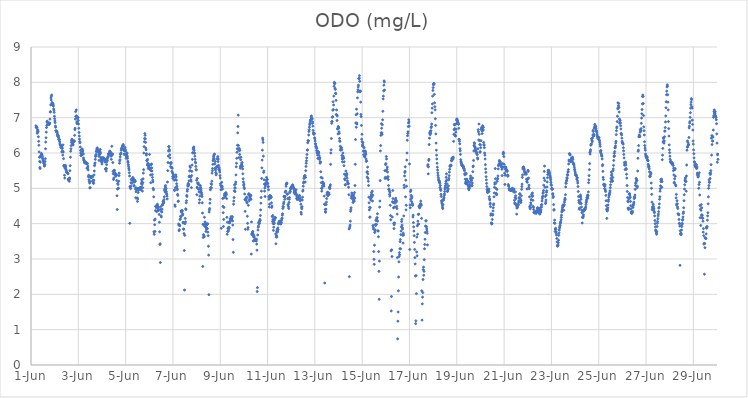
| Category | ODO (mg/L) |
|---|---|
| 44348.208333333336 | 6.77 |
| 44348.21875 | 6.73 |
| 44348.229166666664 | 6.72 |
| 44348.239583333336 | 6.73 |
| 44348.25 | 6.72 |
| 44348.260416666664 | 6.56 |
| 44348.270833333336 | 6.61 |
| 44348.28125 | 6.66 |
| 44348.291666666664 | 6.63 |
| 44348.302083333336 | 6.6 |
| 44348.3125 | 6.46 |
| 44348.322916666664 | 6.33 |
| 44348.333333333336 | 6.22 |
| 44348.34375 | 6.03 |
| 44348.354166666664 | 5.88 |
| 44348.364583333336 | 5.76 |
| 44348.375 | 5.59 |
| 44348.385416666664 | 5.56 |
| 44348.395833333336 | 5.74 |
| 44348.40625 | 5.89 |
| 44348.416666666664 | 5.92 |
| 44348.427083333336 | 5.94 |
| 44348.4375 | 5.99 |
| 44348.447916666664 | 5.97 |
| 44348.458333333336 | 5.95 |
| 44348.46875 | 5.93 |
| 44348.479166666664 | 5.9 |
| 44348.489583333336 | 5.85 |
| 44348.5 | 5.83 |
| 44348.510416666664 | 5.8 |
| 44348.520833333336 | 5.77 |
| 44348.53125 | 5.75 |
| 44348.541666666664 | 5.71 |
| 44348.552083333336 | 5.7 |
| 44348.5625 | 5.63 |
| 44348.572916666664 | 5.64 |
| 44348.583333333336 | 5.67 |
| 44348.59375 | 5.76 |
| 44348.604166666664 | 5.84 |
| 44348.614583333336 | 6.12 |
| 44348.625 | 6.31 |
| 44348.635416666664 | 6.43 |
| 44348.645833333336 | 6.59 |
| 44348.65625 | 6.72 |
| 44348.666666666664 | 6.78 |
| 44348.677083333336 | 6.88 |
| 44348.6875 | 6.9 |
| 44348.697916666664 | 6.86 |
| 44348.708333333336 | 6.81 |
| 44348.71875 | 6.82 |
| 44348.729166666664 | 6.82 |
| 44348.739583333336 | 6.81 |
| 44348.75 | 6.81 |
| 44348.760416666664 | 6.83 |
| 44348.770833333336 | 6.81 |
| 44348.78125 | 6.84 |
| 44348.791666666664 | 6.85 |
| 44348.802083333336 | 6.96 |
| 44348.8125 | 7.16 |
| 44348.822916666664 | 7.17 |
| 44348.833333333336 | 7.36 |
| 44348.84375 | 7.56 |
| 44348.854166666664 | 7.5 |
| 44348.864583333336 | 7.61 |
| 44348.875 | 7.64 |
| 44348.885416666664 | 7.43 |
| 44348.895833333336 | 7.4 |
| 44348.90625 | 7.36 |
| 44348.916666666664 | 7.38 |
| 44348.927083333336 | 7.4 |
| 44348.9375 | 7.36 |
| 44348.947916666664 | 7.33 |
| 44348.958333333336 | 7.25 |
| 44348.96875 | 7.21 |
| 44348.979166666664 | 7.15 |
| 44348.989583333336 | 7.04 |
| 44349.0 | 6.97 |
| 44349.010416666664 | 6.91 |
| 44349.020833333336 | 6.86 |
| 44349.03125 | 6.76 |
| 44349.041666666664 | 6.73 |
| 44349.052083333336 | 6.63 |
| 44349.0625 | 6.63 |
| 44349.072916666664 | 6.6 |
| 44349.083333333336 | 6.6 |
| 44349.09375 | 6.61 |
| 44349.104166666664 | 6.58 |
| 44349.114583333336 | 6.51 |
| 44349.125 | 6.53 |
| 44349.135416666664 | 6.47 |
| 44349.145833333336 | 6.47 |
| 44349.15625 | 6.49 |
| 44349.166666666664 | 6.43 |
| 44349.177083333336 | 6.38 |
| 44349.1875 | 6.38 |
| 44349.197916666664 | 6.39 |
| 44349.208333333336 | 6.33 |
| 44349.21875 | 6.28 |
| 44349.229166666664 | 6.23 |
| 44349.239583333336 | 6.23 |
| 44349.25 | 6.22 |
| 44349.260416666664 | 6.17 |
| 44349.270833333336 | 6.16 |
| 44349.28125 | 6.2 |
| 44349.291666666664 | 6.14 |
| 44349.302083333336 | 6.03 |
| 44349.3125 | 6.16 |
| 44349.322916666664 | 6.13 |
| 44349.333333333336 | 6.06 |
| 44349.34375 | 5.94 |
| 44349.354166666664 | 6.23 |
| 44349.364583333336 | 6.03 |
| 44349.375 | 5.84 |
| 44349.385416666664 | 5.65 |
| 44349.395833333336 | 5.62 |
| 44349.40625 | 5.64 |
| 44349.416666666664 | 5.37 |
| 44349.427083333336 | 5.29 |
| 44349.4375 | 5.57 |
| 44349.447916666664 | 5.63 |
| 44349.458333333336 | 5.65 |
| 44349.46875 | 5.6 |
| 44349.479166666664 | 5.54 |
| 44349.489583333336 | 5.51 |
| 44349.5 | 5.47 |
| 44349.510416666664 | 5.46 |
| 44349.520833333336 | 5.45 |
| 44349.53125 | 5.44 |
| 44349.541666666664 | 5.44 |
| 44349.552083333336 | 5.42 |
| 44349.5625 | 5.41 |
| 44349.572916666664 | 5.24 |
| 44349.583333333336 | 5.25 |
| 44349.59375 | 5.26 |
| 44349.604166666664 | 5.28 |
| 44349.614583333336 | 5.2 |
| 44349.625 | 5.25 |
| 44349.635416666664 | 5.29 |
| 44349.645833333336 | 5.5 |
| 44349.65625 | 5.64 |
| 44349.666666666664 | 5.88 |
| 44349.677083333336 | 6.05 |
| 44349.6875 | 6.12 |
| 44349.697916666664 | 6.21 |
| 44349.708333333336 | 6.3 |
| 44349.71875 | 6.36 |
| 44349.729166666664 | 6.39 |
| 44349.739583333336 | 6.34 |
| 44349.75 | 6.28 |
| 44349.760416666664 | 6.23 |
| 44349.770833333336 | 6.29 |
| 44349.78125 | 6.23 |
| 44349.791666666664 | 6.31 |
| 44349.802083333336 | 6.35 |
| 44349.8125 | 6.34 |
| 44349.822916666664 | 6.34 |
| 44349.833333333336 | 6.33 |
| 44349.84375 | 6.5 |
| 44349.854166666664 | 6.66 |
| 44349.864583333336 | 6.7 |
| 44349.875 | 6.96 |
| 44349.885416666664 | 7.17 |
| 44349.895833333336 | 7.04 |
| 44349.90625 | 7.04 |
| 44349.916666666664 | 7.22 |
| 44349.927083333336 | 7.05 |
| 44349.9375 | 6.88 |
| 44349.947916666664 | 6.83 |
| 44349.958333333336 | 6.86 |
| 44349.96875 | 6.98 |
| 44349.979166666664 | 7 |
| 44349.989583333336 | 7 |
| 44350.0 | 6.92 |
| 44350.010416666664 | 6.82 |
| 44350.020833333336 | 6.7 |
| 44350.03125 | 6.58 |
| 44350.041666666664 | 6.48 |
| 44350.052083333336 | 6.39 |
| 44350.0625 | 6.32 |
| 44350.072916666664 | 6.29 |
| 44350.083333333336 | 6.17 |
| 44350.09375 | 6.07 |
| 44350.104166666664 | 6 |
| 44350.114583333336 | 5.93 |
| 44350.125 | 5.93 |
| 44350.135416666664 | 5.94 |
| 44350.145833333336 | 5.95 |
| 44350.15625 | 6.11 |
| 44350.166666666664 | 6.11 |
| 44350.177083333336 | 6.04 |
| 44350.1875 | 6.06 |
| 44350.197916666664 | 5.98 |
| 44350.208333333336 | 5.97 |
| 44350.21875 | 5.86 |
| 44350.229166666664 | 5.82 |
| 44350.239583333336 | 5.79 |
| 44350.25 | 5.78 |
| 44350.260416666664 | 5.73 |
| 44350.270833333336 | 5.72 |
| 44350.28125 | 5.74 |
| 44350.291666666664 | 5.74 |
| 44350.302083333336 | 5.72 |
| 44350.3125 | 5.74 |
| 44350.322916666664 | 5.73 |
| 44350.333333333336 | 5.71 |
| 44350.34375 | 5.71 |
| 44350.354166666664 | 5.7 |
| 44350.364583333336 | 5.57 |
| 44350.375 | 5.71 |
| 44350.385416666664 | 5.7 |
| 44350.395833333336 | 5.58 |
| 44350.40625 | 5.63 |
| 44350.416666666664 | 5.52 |
| 44350.427083333336 | 5.33 |
| 44350.4375 | 5.37 |
| 44350.447916666664 | 5.24 |
| 44350.458333333336 | 5.33 |
| 44350.46875 | 5.19 |
| 44350.479166666664 | 5.15 |
| 44350.489583333336 | 5.01 |
| 44350.5 | 5.02 |
| 44350.510416666664 | 5.19 |
| 44350.520833333336 | 5.3 |
| 44350.53125 | 5.33 |
| 44350.541666666664 | 5.34 |
| 44350.552083333336 | 5.31 |
| 44350.5625 | 5.31 |
| 44350.572916666664 | 5.33 |
| 44350.583333333336 | 5.33 |
| 44350.59375 | 5.32 |
| 44350.604166666664 | 5.34 |
| 44350.614583333336 | 5.22 |
| 44350.625 | 5.19 |
| 44350.635416666664 | 5.15 |
| 44350.645833333336 | 5.14 |
| 44350.65625 | 5.23 |
| 44350.666666666664 | 5.38 |
| 44350.677083333336 | 5.49 |
| 44350.6875 | 5.64 |
| 44350.697916666664 | 5.69 |
| 44350.708333333336 | 5.72 |
| 44350.71875 | 5.82 |
| 44350.729166666664 | 5.9 |
| 44350.739583333336 | 5.93 |
| 44350.75 | 5.96 |
| 44350.760416666664 | 6.04 |
| 44350.770833333336 | 6.06 |
| 44350.78125 | 6.11 |
| 44350.791666666664 | 6.14 |
| 44350.802083333336 | 6.14 |
| 44350.8125 | 6.1 |
| 44350.822916666664 | 6.06 |
| 44350.833333333336 | 6.08 |
| 44350.84375 | 6.05 |
| 44350.854166666664 | 6.01 |
| 44350.864583333336 | 5.91 |
| 44350.875 | 5.79 |
| 44350.885416666664 | 5.96 |
| 44350.895833333336 | 6.05 |
| 44350.90625 | 5.96 |
| 44350.916666666664 | 6.05 |
| 44350.927083333336 | 6.1 |
| 44350.9375 | 6 |
| 44350.947916666664 | 5.88 |
| 44350.958333333336 | 5.84 |
| 44350.96875 | 5.77 |
| 44350.979166666664 | 5.79 |
| 44350.989583333336 | 5.74 |
| 44351.0 | 5.69 |
| 44351.010416666664 | 5.79 |
| 44351.020833333336 | 5.77 |
| 44351.03125 | 5.84 |
| 44351.041666666664 | 5.87 |
| 44351.052083333336 | 5.86 |
| 44351.0625 | 5.85 |
| 44351.072916666664 | 5.84 |
| 44351.083333333336 | 5.84 |
| 44351.09375 | 5.85 |
| 44351.104166666664 | 5.82 |
| 44351.114583333336 | 5.83 |
| 44351.125 | 5.79 |
| 44351.135416666664 | 5.74 |
| 44351.145833333336 | 5.55 |
| 44351.15625 | 5.56 |
| 44351.166666666664 | 5.54 |
| 44351.177083333336 | 5.49 |
| 44351.1875 | 5.56 |
| 44351.197916666664 | 5.67 |
| 44351.208333333336 | 5.75 |
| 44351.21875 | 5.83 |
| 44351.229166666664 | 5.79 |
| 44351.239583333336 | 5.87 |
| 44351.25 | 5.88 |
| 44351.260416666664 | 5.91 |
| 44351.270833333336 | 5.97 |
| 44351.28125 | 5.98 |
| 44351.291666666664 | 5.98 |
| 44351.302083333336 | 5.96 |
| 44351.3125 | 6 |
| 44351.322916666664 | 6.05 |
| 44351.333333333336 | 5.98 |
| 44351.34375 | 6.05 |
| 44351.354166666664 | 6.03 |
| 44351.364583333336 | 6 |
| 44351.375 | 5.92 |
| 44351.385416666664 | 5.91 |
| 44351.395833333336 | 5.82 |
| 44351.40625 | 5.97 |
| 44351.416666666664 | 6.19 |
| 44351.427083333336 | 5.94 |
| 44351.4375 | 5.97 |
| 44351.447916666664 | 5.97 |
| 44351.458333333336 | 5.73 |
| 44351.46875 | 5.48 |
| 44351.479166666664 | 5.41 |
| 44351.489583333336 | 5.25 |
| 44351.5 | 5.29 |
| 44351.510416666664 | 5.51 |
| 44351.520833333336 | 5.45 |
| 44351.53125 | 5.51 |
| 44351.541666666664 | 5.43 |
| 44351.552083333336 | 5.44 |
| 44351.5625 | 5.38 |
| 44351.572916666664 | 5.37 |
| 44351.583333333336 | 5.34 |
| 44351.59375 | 5.37 |
| 44351.604166666664 | 5.37 |
| 44351.614583333336 | 5.39 |
| 44351.625 | 5.22 |
| 44351.635416666664 | 4.79 |
| 44351.645833333336 | 4.4 |
| 44351.65625 | 4.98 |
| 44351.666666666664 | 5.14 |
| 44351.677083333336 | 5.11 |
| 44351.6875 | 5 |
| 44351.697916666664 | 5 |
| 44351.708333333336 | 5.2 |
| 44351.71875 | 5.36 |
| 44351.729166666664 | 5.43 |
| 44351.739583333336 | 5.71 |
| 44351.75 | 5.78 |
| 44351.760416666664 | 5.81 |
| 44351.770833333336 | 5.89 |
| 44351.78125 | 5.96 |
| 44351.791666666664 | 5.98 |
| 44351.802083333336 | 6 |
| 44351.8125 | 6.08 |
| 44351.822916666664 | 6.12 |
| 44351.833333333336 | 6.14 |
| 44351.84375 | 6.12 |
| 44351.854166666664 | 6.13 |
| 44351.864583333336 | 6.2 |
| 44351.875 | 6.18 |
| 44351.885416666664 | 6.2 |
| 44351.895833333336 | 6.24 |
| 44351.90625 | 6.21 |
| 44351.916666666664 | 6.1 |
| 44351.927083333336 | 6.07 |
| 44351.9375 | 5.96 |
| 44351.947916666664 | 5.97 |
| 44351.958333333336 | 6.09 |
| 44351.96875 | 6.07 |
| 44351.979166666664 | 6.16 |
| 44351.989583333336 | 6.1 |
| 44352.0 | 6.05 |
| 44352.010416666664 | 5.96 |
| 44352.020833333336 | 5.85 |
| 44352.03125 | 5.92 |
| 44352.041666666664 | 5.9 |
| 44352.052083333336 | 5.98 |
| 44352.0625 | 6 |
| 44352.072916666664 | 5.91 |
| 44352.083333333336 | 5.85 |
| 44352.09375 | 5.77 |
| 44352.104166666664 | 5.73 |
| 44352.114583333336 | 5.67 |
| 44352.125 | 5.62 |
| 44352.135416666664 | 5.57 |
| 44352.145833333336 | 5.52 |
| 44352.15625 | 5.44 |
| 44352.166666666664 | 5.35 |
| 44352.177083333336 | 4.01 |
| 44352.1875 | 5.05 |
| 44352.197916666664 | 5.03 |
| 44352.208333333336 | 4.99 |
| 44352.21875 | 5.06 |
| 44352.229166666664 | 5.16 |
| 44352.239583333336 | 5.25 |
| 44352.25 | 5.25 |
| 44352.260416666664 | 5.14 |
| 44352.270833333336 | 5.24 |
| 44352.28125 | 5.24 |
| 44352.291666666664 | 5.25 |
| 44352.302083333336 | 5.31 |
| 44352.3125 | 5.26 |
| 44352.322916666664 | 5.2 |
| 44352.333333333336 | 5.28 |
| 44352.34375 | 5.18 |
| 44352.354166666664 | 5.08 |
| 44352.364583333336 | 5.06 |
| 44352.375 | 5.18 |
| 44352.385416666664 | 5.2 |
| 44352.395833333336 | 5.23 |
| 44352.40625 | 5.2 |
| 44352.416666666664 | 4.98 |
| 44352.427083333336 | 4.73 |
| 44352.4375 | 4.9 |
| 44352.447916666664 | 5.01 |
| 44352.458333333336 | 4.96 |
| 44352.46875 | 4.98 |
| 44352.479166666664 | 5 |
| 44352.489583333336 | 4.73 |
| 44352.5 | 4.63 |
| 44352.510416666664 | 4.7 |
| 44352.520833333336 | 4.99 |
| 44352.53125 | 4.88 |
| 44352.541666666664 | 4.94 |
| 44352.552083333336 | 4.98 |
| 44352.5625 | 4.99 |
| 44352.572916666664 | 5 |
| 44352.583333333336 | 5.01 |
| 44352.59375 | 5 |
| 44352.604166666664 | 4.99 |
| 44352.614583333336 | 4.99 |
| 44352.625 | 5.02 |
| 44352.635416666664 | 5 |
| 44352.645833333336 | 4.96 |
| 44352.65625 | 5.04 |
| 44352.666666666664 | 5.14 |
| 44352.677083333336 | 5.24 |
| 44352.6875 | 5.18 |
| 44352.697916666664 | 5.11 |
| 44352.708333333336 | 4.92 |
| 44352.71875 | 5.02 |
| 44352.729166666664 | 5.16 |
| 44352.739583333336 | 5.27 |
| 44352.75 | 5.43 |
| 44352.760416666664 | 5.53 |
| 44352.770833333336 | 6 |
| 44352.78125 | 6.18 |
| 44352.791666666664 | 6.32 |
| 44352.802083333336 | 6.41 |
| 44352.8125 | 6.55 |
| 44352.822916666664 | 6.5 |
| 44352.833333333336 | 6.4 |
| 44352.84375 | 6.3 |
| 44352.854166666664 | 6.14 |
| 44352.864583333336 | 6.09 |
| 44352.875 | 5.94 |
| 44352.885416666664 | 5.98 |
| 44352.895833333336 | 5.79 |
| 44352.90625 | 5.78 |
| 44352.916666666664 | 5.66 |
| 44352.927083333336 | 5.82 |
| 44352.9375 | 5.71 |
| 44352.947916666664 | 5.65 |
| 44352.958333333336 | 5.56 |
| 44352.96875 | 5.6 |
| 44352.979166666664 | 5.65 |
| 44352.989583333336 | 5.65 |
| 44353.0 | 5.67 |
| 44353.010416666664 | 5.96 |
| 44353.020833333336 | 5.59 |
| 44353.03125 | 5.53 |
| 44353.041666666664 | 5.55 |
| 44353.052083333336 | 5.38 |
| 44353.0625 | 5.16 |
| 44353.072916666664 | 5.5 |
| 44353.083333333336 | 5.67 |
| 44353.09375 | 5.69 |
| 44353.104166666664 | 5.58 |
| 44353.114583333336 | 5.49 |
| 44353.125 | 5.39 |
| 44353.135416666664 | 5.31 |
| 44353.145833333336 | 5.23 |
| 44353.15625 | 5.18 |
| 44353.166666666664 | 5 |
| 44353.177083333336 | 4.96 |
| 44353.1875 | 4.76 |
| 44353.197916666664 | 3.77 |
| 44353.208333333336 | 3.7 |
| 44353.21875 | 4.1 |
| 44353.229166666664 | 3.97 |
| 44353.239583333336 | 3.78 |
| 44353.25 | 4.13 |
| 44353.260416666664 | 4.37 |
| 44353.270833333336 | 4.49 |
| 44353.28125 | 4.49 |
| 44353.291666666664 | 4.48 |
| 44353.302083333336 | 4.45 |
| 44353.3125 | 4.34 |
| 44353.322916666664 | 4.48 |
| 44353.333333333336 | 4.53 |
| 44353.34375 | 4.55 |
| 44353.354166666664 | 4.37 |
| 44353.364583333336 | 4.49 |
| 44353.375 | 4.43 |
| 44353.385416666664 | 4.46 |
| 44353.395833333336 | 4.39 |
| 44353.40625 | 4.38 |
| 44353.416666666664 | 4.26 |
| 44353.427083333336 | 4.04 |
| 44353.4375 | 3.77 |
| 44353.447916666664 | 3.41 |
| 44353.458333333336 | 3.43 |
| 44353.46875 | 2.9 |
| 44353.479166666664 | 4.48 |
| 44353.489583333336 | 4.4 |
| 44353.5 | 4.22 |
| 44353.510416666664 | 4.19 |
| 44353.520833333336 | 4.34 |
| 44353.53125 | 4.33 |
| 44353.541666666664 | 4.41 |
| 44353.552083333336 | 4.53 |
| 44353.5625 | 4.53 |
| 44353.572916666664 | 4.56 |
| 44353.583333333336 | 4.62 |
| 44353.59375 | 4.64 |
| 44353.604166666664 | 4.58 |
| 44353.614583333336 | 4.61 |
| 44353.625 | 4.68 |
| 44353.635416666664 | 4.76 |
| 44353.645833333336 | 4.95 |
| 44353.65625 | 4.98 |
| 44353.666666666664 | 4.9 |
| 44353.677083333336 | 5.04 |
| 44353.6875 | 5.08 |
| 44353.697916666664 | 4.98 |
| 44353.708333333336 | 5 |
| 44353.71875 | 4.91 |
| 44353.729166666664 | 4.86 |
| 44353.739583333336 | 4.82 |
| 44353.75 | 4.78 |
| 44353.760416666664 | 4.7 |
| 44353.770833333336 | 5.18 |
| 44353.78125 | 5.5 |
| 44353.791666666664 | 5.73 |
| 44353.802083333336 | 5.91 |
| 44353.8125 | 6.06 |
| 44353.822916666664 | 6.18 |
| 44353.833333333336 | 6.18 |
| 44353.84375 | 6.1 |
| 44353.854166666664 | 6.06 |
| 44353.864583333336 | 5.95 |
| 44353.875 | 5.86 |
| 44353.885416666664 | 5.71 |
| 44353.895833333336 | 5.62 |
| 44353.90625 | 5.7 |
| 44353.916666666664 | 5.71 |
| 44353.927083333336 | 5.73 |
| 44353.9375 | 5.58 |
| 44353.947916666664 | 5.59 |
| 44353.958333333336 | 5.48 |
| 44353.96875 | 5.57 |
| 44353.979166666664 | 5.44 |
| 44353.989583333336 | 5.33 |
| 44354.0 | 5.28 |
| 44354.010416666664 | 5.4 |
| 44354.020833333336 | 5.38 |
| 44354.03125 | 5.32 |
| 44354.041666666664 | 5.33 |
| 44354.052083333336 | 5.23 |
| 44354.0625 | 4.95 |
| 44354.072916666664 | 4.94 |
| 44354.083333333336 | 4.53 |
| 44354.09375 | 4.49 |
| 44354.104166666664 | 5.02 |
| 44354.114583333336 | 5.25 |
| 44354.125 | 5.38 |
| 44354.135416666664 | 5.33 |
| 44354.145833333336 | 5.23 |
| 44354.15625 | 5.13 |
| 44354.166666666664 | 5.06 |
| 44354.177083333336 | 5 |
| 44354.1875 | 4.96 |
| 44354.197916666664 | 4.83 |
| 44354.208333333336 | 4.8 |
| 44354.21875 | 4.63 |
| 44354.229166666664 | 4.64 |
| 44354.239583333336 | 3.99 |
| 44354.25 | 3.96 |
| 44354.260416666664 | 3.8 |
| 44354.270833333336 | 3.83 |
| 44354.28125 | 3.96 |
| 44354.291666666664 | 3.94 |
| 44354.302083333336 | 4.12 |
| 44354.3125 | 4.13 |
| 44354.322916666664 | 4.21 |
| 44354.333333333336 | 4.19 |
| 44354.34375 | 4.36 |
| 44354.354166666664 | 4.35 |
| 44354.364583333336 | 4.32 |
| 44354.375 | 4.37 |
| 44354.385416666664 | 4.34 |
| 44354.395833333336 | 4.37 |
| 44354.40625 | 4.24 |
| 44354.416666666664 | 4.27 |
| 44354.427083333336 | 4.04 |
| 44354.4375 | 4.02 |
| 44354.447916666664 | 3.85 |
| 44354.458333333336 | 3.84 |
| 44354.46875 | 3.72 |
| 44354.479166666664 | 3.24 |
| 44354.489583333336 | 2.12 |
| 44354.5 | 3.67 |
| 44354.510416666664 | 4 |
| 44354.520833333336 | 4.15 |
| 44354.53125 | 4.05 |
| 44354.541666666664 | 4.42 |
| 44354.552083333336 | 4.4 |
| 44354.5625 | 4.59 |
| 44354.572916666664 | 4.65 |
| 44354.583333333336 | 4.8 |
| 44354.59375 | 4.77 |
| 44354.604166666664 | 4.92 |
| 44354.614583333336 | 4.97 |
| 44354.625 | 5.09 |
| 44354.635416666664 | 5.06 |
| 44354.645833333336 | 5.14 |
| 44354.65625 | 5.08 |
| 44354.666666666664 | 5.11 |
| 44354.677083333336 | 5.21 |
| 44354.6875 | 5.33 |
| 44354.697916666664 | 5.35 |
| 44354.708333333336 | 5.49 |
| 44354.71875 | 5.63 |
| 44354.729166666664 | 5.5 |
| 44354.739583333336 | 5.59 |
| 44354.75 | 5.32 |
| 44354.760416666664 | 5.24 |
| 44354.770833333336 | 5.2 |
| 44354.78125 | 5.02 |
| 44354.791666666664 | 5.36 |
| 44354.802083333336 | 5.48 |
| 44354.8125 | 5.66 |
| 44354.822916666664 | 5.82 |
| 44354.833333333336 | 6.01 |
| 44354.84375 | 6 |
| 44354.854166666664 | 6.11 |
| 44354.864583333336 | 6.15 |
| 44354.875 | 6.14 |
| 44354.885416666664 | 6.17 |
| 44354.895833333336 | 6.08 |
| 44354.90625 | 6.01 |
| 44354.916666666664 | 5.99 |
| 44354.927083333336 | 5.91 |
| 44354.9375 | 5.82 |
| 44354.947916666664 | 5.74 |
| 44354.958333333336 | 5.72 |
| 44354.96875 | 5.62 |
| 44354.979166666664 | 5.53 |
| 44354.989583333336 | 5.52 |
| 44355.0 | 5.23 |
| 44355.010416666664 | 4.82 |
| 44355.020833333336 | 5.03 |
| 44355.03125 | 5.28 |
| 44355.041666666664 | 5.15 |
| 44355.052083333336 | 5 |
| 44355.0625 | 5.12 |
| 44355.072916666664 | 5.15 |
| 44355.083333333336 | 5.11 |
| 44355.09375 | 4.97 |
| 44355.104166666664 | 4.9 |
| 44355.114583333336 | 4.59 |
| 44355.125 | 4.68 |
| 44355.135416666664 | 4.78 |
| 44355.145833333336 | 4.89 |
| 44355.15625 | 5.08 |
| 44355.166666666664 | 5.03 |
| 44355.177083333336 | 4.99 |
| 44355.1875 | 4.95 |
| 44355.197916666664 | 4.89 |
| 44355.208333333336 | 4.87 |
| 44355.21875 | 4.82 |
| 44355.229166666664 | 4.77 |
| 44355.239583333336 | 4.59 |
| 44355.25 | 4.3 |
| 44355.260416666664 | 2.79 |
| 44355.270833333336 | 3.98 |
| 44355.28125 | 3.61 |
| 44355.291666666664 | 3.69 |
| 44355.302083333336 | 3.98 |
| 44355.3125 | 3.66 |
| 44355.322916666664 | 3.63 |
| 44355.333333333336 | 4.18 |
| 44355.34375 | 3.93 |
| 44355.354166666664 | 4.05 |
| 44355.364583333336 | 3.92 |
| 44355.375 | 3.97 |
| 44355.385416666664 | 4.01 |
| 44355.395833333336 | 3.78 |
| 44355.40625 | 3.9 |
| 44355.416666666664 | 3.84 |
| 44355.427083333336 | 3.87 |
| 44355.4375 | 3.97 |
| 44355.447916666664 | 3.98 |
| 44355.458333333336 | 3.86 |
| 44355.46875 | 4 |
| 44355.479166666664 | 3.76 |
| 44355.489583333336 | 3.66 |
| 44355.5 | 3.36 |
| 44355.510416666664 | 3.11 |
| 44355.520833333336 | 1.99 |
| 44355.53125 | 4.33 |
| 44355.541666666664 | 4.39 |
| 44355.552083333336 | 4.43 |
| 44355.5625 | 4.58 |
| 44355.572916666664 | 4.69 |
| 44355.583333333336 | 4.96 |
| 44355.59375 | 5.02 |
| 44355.604166666664 | 5.01 |
| 44355.614583333336 | 5.13 |
| 44355.625 | 5.02 |
| 44355.635416666664 | 5.11 |
| 44355.645833333336 | 5.2 |
| 44355.65625 | 5.43 |
| 44355.666666666664 | 5.5 |
| 44355.677083333336 | 5.56 |
| 44355.6875 | 5.68 |
| 44355.697916666664 | 5.78 |
| 44355.708333333336 | 5.83 |
| 44355.71875 | 5.89 |
| 44355.729166666664 | 5.92 |
| 44355.739583333336 | 5.95 |
| 44355.75 | 5.83 |
| 44355.760416666664 | 5.97 |
| 44355.770833333336 | 5.69 |
| 44355.78125 | 5.57 |
| 44355.791666666664 | 5.76 |
| 44355.802083333336 | 5.52 |
| 44355.8125 | 5.45 |
| 44355.822916666664 | 5.38 |
| 44355.833333333336 | 5.41 |
| 44355.84375 | 5.59 |
| 44355.854166666664 | 5.61 |
| 44355.864583333336 | 5.63 |
| 44355.875 | 5.83 |
| 44355.885416666664 | 5.85 |
| 44355.895833333336 | 5.9 |
| 44355.90625 | 5.76 |
| 44355.916666666664 | 5.83 |
| 44355.927083333336 | 5.65 |
| 44355.9375 | 5.53 |
| 44355.947916666664 | 5.59 |
| 44355.958333333336 | 5.55 |
| 44355.96875 | 5.51 |
| 44355.979166666664 | 5.46 |
| 44355.989583333336 | 5.36 |
| 44356.0 | 5.29 |
| 44356.010416666664 | 5.13 |
| 44356.020833333336 | 5.08 |
| 44356.03125 | 4.96 |
| 44356.041666666664 | 3.87 |
| 44356.052083333336 | 5.04 |
| 44356.0625 | 5.17 |
| 44356.072916666664 | 5.03 |
| 44356.083333333336 | 5.06 |
| 44356.09375 | 4.98 |
| 44356.104166666664 | 4.71 |
| 44356.114583333336 | 4.49 |
| 44356.125 | 4.31 |
| 44356.135416666664 | 3.92 |
| 44356.145833333336 | 4.12 |
| 44356.15625 | 4.46 |
| 44356.166666666664 | 4.74 |
| 44356.177083333336 | 4.81 |
| 44356.1875 | 4.85 |
| 44356.197916666664 | 4.79 |
| 44356.208333333336 | 4.77 |
| 44356.21875 | 4.81 |
| 44356.229166666664 | 4.84 |
| 44356.239583333336 | 4.88 |
| 44356.25 | 4.85 |
| 44356.260416666664 | 4.82 |
| 44356.270833333336 | 4.71 |
| 44356.28125 | 4.18 |
| 44356.291666666664 | 3.7 |
| 44356.302083333336 | 4.04 |
| 44356.3125 | 3.78 |
| 44356.322916666664 | 3.87 |
| 44356.333333333336 | 3.78 |
| 44356.34375 | 3.88 |
| 44356.354166666664 | 3.82 |
| 44356.364583333336 | 3.9 |
| 44356.375 | 4.03 |
| 44356.385416666664 | 3.88 |
| 44356.395833333336 | 4.06 |
| 44356.40625 | 4.02 |
| 44356.416666666664 | 4.14 |
| 44356.427083333336 | 4.1 |
| 44356.4375 | 4.11 |
| 44356.447916666664 | 4.13 |
| 44356.458333333336 | 4.2 |
| 44356.46875 | 4.1 |
| 44356.479166666664 | 4.17 |
| 44356.489583333336 | 4.13 |
| 44356.5 | 4.17 |
| 44356.510416666664 | 4.2 |
| 44356.520833333336 | 4.08 |
| 44356.53125 | 3.96 |
| 44356.541666666664 | 3.55 |
| 44356.552083333336 | 3.19 |
| 44356.5625 | 4.55 |
| 44356.572916666664 | 4.64 |
| 44356.583333333336 | 4.74 |
| 44356.59375 | 4.93 |
| 44356.604166666664 | 5.1 |
| 44356.614583333336 | 5.01 |
| 44356.625 | 4.91 |
| 44356.635416666664 | 5.01 |
| 44356.645833333336 | 5.12 |
| 44356.65625 | 5.18 |
| 44356.666666666664 | 5.38 |
| 44356.677083333336 | 5.61 |
| 44356.6875 | 5.71 |
| 44356.697916666664 | 5.85 |
| 44356.708333333336 | 6.02 |
| 44356.71875 | 6.12 |
| 44356.729166666664 | 6.22 |
| 44356.739583333336 | 6.57 |
| 44356.75 | 6.75 |
| 44356.760416666664 | 7.07 |
| 44356.770833333336 | 6.21 |
| 44356.78125 | 6.08 |
| 44356.791666666664 | 5.87 |
| 44356.802083333336 | 6.13 |
| 44356.8125 | 6.07 |
| 44356.822916666664 | 5.96 |
| 44356.833333333336 | 6.08 |
| 44356.84375 | 5.57 |
| 44356.854166666664 | 5.63 |
| 44356.864583333336 | 5.81 |
| 44356.875 | 5.88 |
| 44356.885416666664 | 5.61 |
| 44356.895833333336 | 5.66 |
| 44356.90625 | 5.71 |
| 44356.916666666664 | 5.65 |
| 44356.927083333336 | 5.73 |
| 44356.9375 | 5.62 |
| 44356.947916666664 | 5.55 |
| 44356.958333333336 | 5.41 |
| 44356.96875 | 5.27 |
| 44356.979166666664 | 5.18 |
| 44356.989583333336 | 5.09 |
| 44357.0 | 5.12 |
| 44357.010416666664 | 5.03 |
| 44357.020833333336 | 4.99 |
| 44357.03125 | 4.84 |
| 44357.041666666664 | 4.68 |
| 44357.052083333336 | 4.35 |
| 44357.0625 | 3.84 |
| 44357.072916666664 | 4.68 |
| 44357.083333333336 | 4.66 |
| 44357.09375 | 4.73 |
| 44357.104166666664 | 4.7 |
| 44357.114583333336 | 4.75 |
| 44357.125 | 4.59 |
| 44357.135416666664 | 4.61 |
| 44357.145833333336 | 4.21 |
| 44357.15625 | 4.01 |
| 44357.166666666664 | 3.84 |
| 44357.177083333336 | 3.89 |
| 44357.1875 | 4.52 |
| 44357.197916666664 | 4.82 |
| 44357.208333333336 | 4.85 |
| 44357.21875 | 4.81 |
| 44357.229166666664 | 4.65 |
| 44357.239583333336 | 4.69 |
| 44357.25 | 4.73 |
| 44357.260416666664 | 4.76 |
| 44357.270833333336 | 4.77 |
| 44357.28125 | 4.81 |
| 44357.291666666664 | 4.8 |
| 44357.302083333336 | 4.69 |
| 44357.3125 | 3.14 |
| 44357.322916666664 | 4.05 |
| 44357.333333333336 | 3.69 |
| 44357.34375 | 3.72 |
| 44357.354166666664 | 3.71 |
| 44357.364583333336 | 3.76 |
| 44357.375 | 3.78 |
| 44357.385416666664 | 3.71 |
| 44357.395833333336 | 3.51 |
| 44357.40625 | 3.64 |
| 44357.416666666664 | 3.67 |
| 44357.427083333336 | 3.62 |
| 44357.4375 | 3.62 |
| 44357.447916666664 | 3.55 |
| 44357.458333333336 | 3.52 |
| 44357.46875 | 3.54 |
| 44357.479166666664 | 3.53 |
| 44357.489583333336 | 3.54 |
| 44357.5 | 3.55 |
| 44357.510416666664 | 3.52 |
| 44357.520833333336 | 3.51 |
| 44357.53125 | 3.56 |
| 44357.541666666664 | 3.42 |
| 44357.552083333336 | 3.25 |
| 44357.5625 | 2.08 |
| 44357.572916666664 | 2.19 |
| 44357.583333333336 | 3.68 |
| 44357.59375 | 3.82 |
| 44357.604166666664 | 3.9 |
| 44357.614583333336 | 3.93 |
| 44357.625 | 4.04 |
| 44357.635416666664 | 4 |
| 44357.645833333336 | 4 |
| 44357.65625 | 4.02 |
| 44357.666666666664 | 4.08 |
| 44357.677083333336 | 4.12 |
| 44357.6875 | 4.09 |
| 44357.697916666664 | 4.23 |
| 44357.708333333336 | 4.39 |
| 44357.71875 | 4.58 |
| 44357.729166666664 | 4.74 |
| 44357.739583333336 | 4.92 |
| 44357.75 | 5.28 |
| 44357.760416666664 | 5.58 |
| 44357.770833333336 | 5.8 |
| 44357.78125 | 6.08 |
| 44357.791666666664 | 6.42 |
| 44357.802083333336 | 6.37 |
| 44357.8125 | 6.3 |
| 44357.822916666664 | 5.91 |
| 44357.833333333336 | 5.45 |
| 44357.84375 | 5.49 |
| 44357.854166666664 | 5.24 |
| 44357.864583333336 | 5.12 |
| 44357.875 | 4.92 |
| 44357.885416666664 | 5.01 |
| 44357.895833333336 | 4.77 |
| 44357.90625 | 5.07 |
| 44357.916666666664 | 5.11 |
| 44357.927083333336 | 5.15 |
| 44357.9375 | 5.15 |
| 44357.947916666664 | 5.23 |
| 44357.958333333336 | 5.31 |
| 44357.96875 | 5.21 |
| 44357.979166666664 | 5.26 |
| 44357.989583333336 | 5.25 |
| 44358.0 | 5.13 |
| 44358.010416666664 | 5.14 |
| 44358.020833333336 | 5.04 |
| 44358.03125 | 5.05 |
| 44358.041666666664 | 4.96 |
| 44358.052083333336 | 4.76 |
| 44358.0625 | 4.69 |
| 44358.072916666664 | 4.47 |
| 44358.083333333336 | 4.55 |
| 44358.09375 | 4.8 |
| 44358.104166666664 | 4.78 |
| 44358.114583333336 | 4.73 |
| 44358.125 | 4.75 |
| 44358.135416666664 | 4.78 |
| 44358.145833333336 | 4.77 |
| 44358.15625 | 4.74 |
| 44358.166666666664 | 4.59 |
| 44358.177083333336 | 4.46 |
| 44358.1875 | 4.5 |
| 44358.197916666664 | 4.2 |
| 44358.208333333336 | 4.06 |
| 44358.21875 | 4.23 |
| 44358.229166666664 | 4.12 |
| 44358.239583333336 | 4 |
| 44358.25 | 3.81 |
| 44358.260416666664 | 3.9 |
| 44358.270833333336 | 4.04 |
| 44358.28125 | 4 |
| 44358.291666666664 | 4.1 |
| 44358.302083333336 | 4.17 |
| 44358.3125 | 4.14 |
| 44358.322916666664 | 4.17 |
| 44358.333333333336 | 4.17 |
| 44358.34375 | 3.71 |
| 44358.354166666664 | 3.43 |
| 44358.364583333336 | 3.62 |
| 44358.375 | 3.67 |
| 44358.385416666664 | 3.78 |
| 44358.395833333336 | 3.62 |
| 44358.40625 | 3.84 |
| 44358.416666666664 | 3.76 |
| 44358.427083333336 | 3.79 |
| 44358.4375 | 3.88 |
| 44358.447916666664 | 3.83 |
| 44358.458333333336 | 4.01 |
| 44358.46875 | 3.99 |
| 44358.479166666664 | 4.02 |
| 44358.489583333336 | 4.05 |
| 44358.5 | 4.07 |
| 44358.510416666664 | 4.04 |
| 44358.520833333336 | 4.02 |
| 44358.53125 | 4.07 |
| 44358.541666666664 | 4.06 |
| 44358.552083333336 | 3.99 |
| 44358.5625 | 4.04 |
| 44358.572916666664 | 4 |
| 44358.583333333336 | 4.04 |
| 44358.59375 | 4.1 |
| 44358.604166666664 | 4.14 |
| 44358.614583333336 | 4.16 |
| 44358.625 | 4.24 |
| 44358.635416666664 | 4.28 |
| 44358.645833333336 | 4.43 |
| 44358.65625 | 4.49 |
| 44358.666666666664 | 4.47 |
| 44358.677083333336 | 4.56 |
| 44358.6875 | 4.61 |
| 44358.697916666664 | 4.77 |
| 44358.708333333336 | 4.77 |
| 44358.71875 | 4.76 |
| 44358.729166666664 | 4.69 |
| 44358.739583333336 | 4.77 |
| 44358.75 | 4.89 |
| 44358.760416666664 | 4.91 |
| 44358.770833333336 | 4.92 |
| 44358.78125 | 5.06 |
| 44358.791666666664 | 5.11 |
| 44358.802083333336 | 5.14 |
| 44358.8125 | 5.13 |
| 44358.822916666664 | 5.15 |
| 44358.833333333336 | 4.83 |
| 44358.84375 | 4.84 |
| 44358.854166666664 | 4.71 |
| 44358.864583333336 | 4.53 |
| 44358.875 | 4.54 |
| 44358.885416666664 | 4.48 |
| 44358.895833333336 | 4.43 |
| 44358.90625 | 4.6 |
| 44358.916666666664 | 4.69 |
| 44358.927083333336 | 4.74 |
| 44358.9375 | 4.88 |
| 44358.947916666664 | 4.9 |
| 44358.958333333336 | 4.92 |
| 44358.96875 | 5 |
| 44358.979166666664 | 4.98 |
| 44358.989583333336 | 5.01 |
| 44359.0 | 5.04 |
| 44359.010416666664 | 5.01 |
| 44359.020833333336 | 5.03 |
| 44359.03125 | 5.04 |
| 44359.041666666664 | 5.08 |
| 44359.052083333336 | 5.06 |
| 44359.0625 | 5.1 |
| 44359.072916666664 | 5.07 |
| 44359.083333333336 | 5.04 |
| 44359.09375 | 5.01 |
| 44359.104166666664 | 5.01 |
| 44359.114583333336 | 4.96 |
| 44359.125 | 4.88 |
| 44359.135416666664 | 4.9 |
| 44359.145833333336 | 4.89 |
| 44359.15625 | 4.84 |
| 44359.166666666664 | 4.88 |
| 44359.177083333336 | 4.9 |
| 44359.1875 | 4.96 |
| 44359.197916666664 | 4.96 |
| 44359.208333333336 | 4.85 |
| 44359.21875 | 4.82 |
| 44359.229166666664 | 4.71 |
| 44359.239583333336 | 4.76 |
| 44359.25 | 4.79 |
| 44359.260416666664 | 4.68 |
| 44359.270833333336 | 4.69 |
| 44359.28125 | 4.74 |
| 44359.291666666664 | 4.7 |
| 44359.302083333336 | 4.73 |
| 44359.3125 | 4.75 |
| 44359.322916666664 | 4.75 |
| 44359.333333333336 | 4.76 |
| 44359.34375 | 4.8 |
| 44359.354166666664 | 4.79 |
| 44359.364583333336 | 4.72 |
| 44359.375 | 4.65 |
| 44359.385416666664 | 4.65 |
| 44359.395833333336 | 4.69 |
| 44359.40625 | 4.55 |
| 44359.416666666664 | 4.32 |
| 44359.427083333336 | 4.27 |
| 44359.4375 | 4.46 |
| 44359.447916666664 | 4.42 |
| 44359.458333333336 | 4.48 |
| 44359.46875 | 4.67 |
| 44359.479166666664 | 4.75 |
| 44359.489583333336 | 4.92 |
| 44359.5 | 4.95 |
| 44359.510416666664 | 5.06 |
| 44359.520833333336 | 5.15 |
| 44359.53125 | 5.18 |
| 44359.541666666664 | 5.28 |
| 44359.552083333336 | 5.32 |
| 44359.5625 | 5.35 |
| 44359.572916666664 | 5.35 |
| 44359.583333333336 | 5.36 |
| 44359.59375 | 5.18 |
| 44359.604166666664 | 5.31 |
| 44359.614583333336 | 5.5 |
| 44359.625 | 5.62 |
| 44359.635416666664 | 5.71 |
| 44359.645833333336 | 5.78 |
| 44359.65625 | 5.86 |
| 44359.666666666664 | 5.96 |
| 44359.677083333336 | 6.08 |
| 44359.6875 | 6.09 |
| 44359.697916666664 | 6.29 |
| 44359.708333333336 | 6.35 |
| 44359.71875 | 6.34 |
| 44359.729166666664 | 6.35 |
| 44359.739583333336 | 6.51 |
| 44359.75 | 6.61 |
| 44359.760416666664 | 6.66 |
| 44359.770833333336 | 6.73 |
| 44359.78125 | 6.8 |
| 44359.791666666664 | 6.84 |
| 44359.802083333336 | 6.88 |
| 44359.8125 | 6.92 |
| 44359.822916666664 | 6.94 |
| 44359.833333333336 | 6.95 |
| 44359.84375 | 7.02 |
| 44359.854166666664 | 7.05 |
| 44359.864583333336 | 6.98 |
| 44359.875 | 6.98 |
| 44359.885416666664 | 6.96 |
| 44359.895833333336 | 6.84 |
| 44359.90625 | 6.88 |
| 44359.916666666664 | 6.76 |
| 44359.927083333336 | 6.64 |
| 44359.9375 | 6.57 |
| 44359.947916666664 | 6.54 |
| 44359.958333333336 | 6.53 |
| 44359.96875 | 6.56 |
| 44359.979166666664 | 6.55 |
| 44359.989583333336 | 6.43 |
| 44360.0 | 6.4 |
| 44360.010416666664 | 6.34 |
| 44360.020833333336 | 6.26 |
| 44360.03125 | 6.26 |
| 44360.041666666664 | 6.19 |
| 44360.052083333336 | 6.19 |
| 44360.0625 | 6.15 |
| 44360.072916666664 | 6.07 |
| 44360.083333333336 | 6.13 |
| 44360.09375 | 6 |
| 44360.104166666664 | 6.02 |
| 44360.114583333336 | 5.94 |
| 44360.125 | 5.85 |
| 44360.135416666664 | 6.02 |
| 44360.145833333336 | 6.04 |
| 44360.15625 | 6.02 |
| 44360.166666666664 | 6 |
| 44360.177083333336 | 5.93 |
| 44360.1875 | 5.82 |
| 44360.197916666664 | 5.84 |
| 44360.208333333336 | 5.87 |
| 44360.21875 | 5.71 |
| 44360.229166666664 | 5.75 |
| 44360.239583333336 | 5.74 |
| 44360.25 | 5.47 |
| 44360.260416666664 | 5.31 |
| 44360.270833333336 | 5.16 |
| 44360.28125 | 5 |
| 44360.291666666664 | 4.92 |
| 44360.302083333336 | 5 |
| 44360.3125 | 5.29 |
| 44360.322916666664 | 5.07 |
| 44360.333333333336 | 5.18 |
| 44360.34375 | 5.14 |
| 44360.354166666664 | 5.15 |
| 44360.364583333336 | 5.14 |
| 44360.375 | 5.11 |
| 44360.385416666664 | 5.06 |
| 44360.395833333336 | 4.78 |
| 44360.40625 | 4.55 |
| 44360.416666666664 | 2.32 |
| 44360.427083333336 | 4.54 |
| 44360.4375 | 4.4 |
| 44360.447916666664 | 4.33 |
| 44360.458333333336 | 4.33 |
| 44360.46875 | 4.41 |
| 44360.479166666664 | 4.54 |
| 44360.489583333336 | 4.61 |
| 44360.5 | 4.71 |
| 44360.510416666664 | 4.83 |
| 44360.520833333336 | 4.88 |
| 44360.53125 | 4.86 |
| 44360.541666666664 | 4.89 |
| 44360.552083333336 | 4.79 |
| 44360.5625 | 4.81 |
| 44360.572916666664 | 4.85 |
| 44360.583333333336 | 4.83 |
| 44360.59375 | 4.87 |
| 44360.604166666664 | 4.83 |
| 44360.614583333336 | 5.01 |
| 44360.625 | 5.04 |
| 44360.635416666664 | 4.99 |
| 44360.645833333336 | 5.06 |
| 44360.65625 | 5.1 |
| 44360.666666666664 | 5.68 |
| 44360.677083333336 | 6 |
| 44360.6875 | 6.09 |
| 44360.697916666664 | 6.41 |
| 44360.708333333336 | 6.84 |
| 44360.71875 | 6.89 |
| 44360.729166666664 | 6.89 |
| 44360.739583333336 | 7.01 |
| 44360.75 | 7.03 |
| 44360.760416666664 | 7.21 |
| 44360.770833333336 | 7.45 |
| 44360.78125 | 7.23 |
| 44360.791666666664 | 7.36 |
| 44360.802083333336 | 7.61 |
| 44360.8125 | 7.89 |
| 44360.822916666664 | 8 |
| 44360.833333333336 | 7.96 |
| 44360.84375 | 7.97 |
| 44360.854166666664 | 7.83 |
| 44360.864583333336 | 7.8 |
| 44360.875 | 7.69 |
| 44360.885416666664 | 7.68 |
| 44360.895833333336 | 7.49 |
| 44360.90625 | 7.09 |
| 44360.916666666664 | 7.22 |
| 44360.927083333336 | 7.08 |
| 44360.9375 | 6.92 |
| 44360.947916666664 | 7.05 |
| 44360.958333333336 | 6.68 |
| 44360.96875 | 6.7 |
| 44360.979166666664 | 6.54 |
| 44360.989583333336 | 6.75 |
| 44361.0 | 6.73 |
| 44361.010416666664 | 6.7 |
| 44361.020833333336 | 6.6 |
| 44361.03125 | 6.56 |
| 44361.041666666664 | 6.41 |
| 44361.052083333336 | 6.34 |
| 44361.0625 | 6.33 |
| 44361.072916666664 | 6.19 |
| 44361.083333333336 | 6.08 |
| 44361.09375 | 6.1 |
| 44361.104166666664 | 6.12 |
| 44361.114583333336 | 6.16 |
| 44361.125 | 6.15 |
| 44361.135416666664 | 6.09 |
| 44361.145833333336 | 5.93 |
| 44361.15625 | 5.83 |
| 44361.166666666664 | 5.75 |
| 44361.177083333336 | 5.87 |
| 44361.1875 | 6 |
| 44361.197916666664 | 5.91 |
| 44361.208333333336 | 5.86 |
| 44361.21875 | 5.85 |
| 44361.229166666664 | 5.64 |
| 44361.239583333336 | 5.75 |
| 44361.25 | 5.4 |
| 44361.260416666664 | 5.27 |
| 44361.270833333336 | 5.24 |
| 44361.28125 | 5.1 |
| 44361.291666666664 | 5.1 |
| 44361.302083333336 | 5.38 |
| 44361.3125 | 5.49 |
| 44361.322916666664 | 5.34 |
| 44361.333333333336 | 5.37 |
| 44361.34375 | 5.42 |
| 44361.354166666664 | 5.4 |
| 44361.364583333336 | 5.29 |
| 44361.375 | 5.21 |
| 44361.385416666664 | 5.17 |
| 44361.395833333336 | 5.13 |
| 44361.40625 | 5.13 |
| 44361.416666666664 | 5.13 |
| 44361.427083333336 | 5.03 |
| 44361.4375 | 4.82 |
| 44361.447916666664 | 3.85 |
| 44361.458333333336 | 2.5 |
| 44361.46875 | 3.88 |
| 44361.479166666664 | 3.93 |
| 44361.489583333336 | 3.96 |
| 44361.5 | 4.07 |
| 44361.510416666664 | 4.35 |
| 44361.520833333336 | 4.4 |
| 44361.53125 | 4.45 |
| 44361.541666666664 | 4.72 |
| 44361.552083333336 | 4.77 |
| 44361.5625 | 4.87 |
| 44361.572916666664 | 4.79 |
| 44361.583333333336 | 4.83 |
| 44361.59375 | 4.71 |
| 44361.604166666664 | 4.8 |
| 44361.614583333336 | 4.6 |
| 44361.625 | 4.64 |
| 44361.635416666664 | 4.82 |
| 44361.645833333336 | 4.76 |
| 44361.65625 | 4.7 |
| 44361.666666666664 | 4.64 |
| 44361.677083333336 | 4.88 |
| 44361.6875 | 4.72 |
| 44361.697916666664 | 5.08 |
| 44361.708333333336 | 5.68 |
| 44361.71875 | 6.38 |
| 44361.729166666664 | 6.85 |
| 44361.739583333336 | 7.08 |
| 44361.75 | 6.73 |
| 44361.760416666664 | 7.24 |
| 44361.770833333336 | 6.85 |
| 44361.78125 | 6.82 |
| 44361.791666666664 | 7.11 |
| 44361.802083333336 | 7.56 |
| 44361.8125 | 7.73 |
| 44361.822916666664 | 7.79 |
| 44361.833333333336 | 7.87 |
| 44361.84375 | 7.92 |
| 44361.854166666664 | 8.11 |
| 44361.864583333336 | 8.1 |
| 44361.875 | 8.12 |
| 44361.885416666664 | 8.19 |
| 44361.895833333336 | 8.03 |
| 44361.90625 | 7.73 |
| 44361.916666666664 | 7.75 |
| 44361.927083333336 | 7.75 |
| 44361.9375 | 7.44 |
| 44361.947916666664 | 7.09 |
| 44361.958333333336 | 7.03 |
| 44361.96875 | 6.78 |
| 44361.979166666664 | 6.39 |
| 44361.989583333336 | 6.53 |
| 44362.0 | 6.32 |
| 44362.010416666664 | 6.2 |
| 44362.020833333336 | 6.24 |
| 44362.03125 | 6.29 |
| 44362.041666666664 | 6.19 |
| 44362.052083333336 | 6.05 |
| 44362.0625 | 5.95 |
| 44362.072916666664 | 6.06 |
| 44362.083333333336 | 6.15 |
| 44362.09375 | 5.92 |
| 44362.104166666664 | 5.89 |
| 44362.114583333336 | 5.9 |
| 44362.125 | 6.06 |
| 44362.135416666664 | 5.99 |
| 44362.145833333336 | 6.03 |
| 44362.15625 | 5.96 |
| 44362.166666666664 | 5.83 |
| 44362.177083333336 | 5.76 |
| 44362.1875 | 5.78 |
| 44362.197916666664 | 5.46 |
| 44362.208333333336 | 5.32 |
| 44362.21875 | 5.47 |
| 44362.229166666664 | 5.6 |
| 44362.239583333336 | 5.41 |
| 44362.25 | 5.28 |
| 44362.260416666664 | 5.2 |
| 44362.270833333336 | 5.08 |
| 44362.28125 | 4.75 |
| 44362.291666666664 | 4.59 |
| 44362.302083333336 | 4.39 |
| 44362.3125 | 4.46 |
| 44362.322916666664 | 4.18 |
| 44362.333333333336 | 4.19 |
| 44362.34375 | 4.45 |
| 44362.354166666664 | 4.71 |
| 44362.364583333336 | 4.67 |
| 44362.375 | 4.78 |
| 44362.385416666664 | 4.82 |
| 44362.395833333336 | 4.88 |
| 44362.40625 | 4.75 |
| 44362.416666666664 | 4.82 |
| 44362.427083333336 | 4.92 |
| 44362.4375 | 4.64 |
| 44362.447916666664 | 4.8 |
| 44362.458333333336 | 3.95 |
| 44362.46875 | 3.9 |
| 44362.479166666664 | 3.85 |
| 44362.489583333336 | 3.21 |
| 44362.5 | 2.99 |
| 44362.510416666664 | 2.85 |
| 44362.520833333336 | 3.39 |
| 44362.53125 | 3.75 |
| 44362.541666666664 | 3.79 |
| 44362.552083333336 | 3.82 |
| 44362.5625 | 3.98 |
| 44362.572916666664 | 3.95 |
| 44362.583333333336 | 4.09 |
| 44362.59375 | 4.11 |
| 44362.604166666664 | 3.98 |
| 44362.614583333336 | 4.16 |
| 44362.625 | 4.1 |
| 44362.635416666664 | 4.17 |
| 44362.645833333336 | 4.28 |
| 44362.65625 | 4.07 |
| 44362.666666666664 | 3.8 |
| 44362.677083333336 | 3.79 |
| 44362.6875 | 3.63 |
| 44362.697916666664 | 3.21 |
| 44362.708333333336 | 2.65 |
| 44362.71875 | 1.86 |
| 44362.729166666664 | 2.94 |
| 44362.739583333336 | 4.47 |
| 44362.75 | 4.64 |
| 44362.760416666664 | 5.22 |
| 44362.770833333336 | 6.06 |
| 44362.78125 | 6.21 |
| 44362.791666666664 | 6.5 |
| 44362.802083333336 | 6.57 |
| 44362.8125 | 6.83 |
| 44362.822916666664 | 6.7 |
| 44362.833333333336 | 6.57 |
| 44362.84375 | 6.53 |
| 44362.854166666664 | 6.8 |
| 44362.864583333336 | 6.94 |
| 44362.875 | 7.18 |
| 44362.885416666664 | 7.53 |
| 44362.895833333336 | 7.61 |
| 44362.90625 | 7.76 |
| 44362.916666666664 | 7.92 |
| 44362.927083333336 | 8.04 |
| 44362.9375 | 8.01 |
| 44362.947916666664 | 7.78 |
| 44362.958333333336 | 5.5 |
| 44362.96875 | 5.28 |
| 44362.979166666664 | 5.31 |
| 44362.989583333336 | 5.67 |
| 44363.0 | 5.7 |
| 44363.010416666664 | 5.5 |
| 44363.020833333336 | 5.9 |
| 44363.03125 | 5.83 |
| 44363.041666666664 | 5.29 |
| 44363.052083333336 | 5.54 |
| 44363.0625 | 5.6 |
| 44363.072916666664 | 5.46 |
| 44363.083333333336 | 5.32 |
| 44363.09375 | 5.33 |
| 44363.104166666664 | 5.25 |
| 44363.114583333336 | 5.08 |
| 44363.125 | 4.97 |
| 44363.135416666664 | 4.98 |
| 44363.145833333336 | 4.93 |
| 44363.15625 | 4.83 |
| 44363.166666666664 | 4.78 |
| 44363.177083333336 | 4.89 |
| 44363.1875 | 4.52 |
| 44363.197916666664 | 4.23 |
| 44363.208333333336 | 4.11 |
| 44363.21875 | 3.23 |
| 44363.229166666664 | 1.53 |
| 44363.239583333336 | 1.94 |
| 44363.25 | 3.26 |
| 44363.260416666664 | 3.07 |
| 44363.270833333336 | 4.19 |
| 44363.28125 | 4.62 |
| 44363.291666666664 | 4.94 |
| 44363.302083333336 | 4.71 |
| 44363.3125 | 4.6 |
| 44363.322916666664 | 4.45 |
| 44363.333333333336 | 4.01 |
| 44363.34375 | 3.86 |
| 44363.354166666664 | 3.97 |
| 44363.364583333336 | 4.02 |
| 44363.375 | 4.47 |
| 44363.385416666664 | 4.58 |
| 44363.395833333336 | 4.64 |
| 44363.40625 | 4.68 |
| 44363.416666666664 | 4.72 |
| 44363.427083333336 | 4.65 |
| 44363.4375 | 4.66 |
| 44363.447916666664 | 4.62 |
| 44363.458333333336 | 4.49 |
| 44363.46875 | 4.43 |
| 44363.479166666664 | 4.27 |
| 44363.489583333336 | 3.04 |
| 44363.5 | 0.74 |
| 44363.510416666664 | 1.24 |
| 44363.520833333336 | 1.5 |
| 44363.53125 | 2.1 |
| 44363.541666666664 | 2.49 |
| 44363.552083333336 | 2.92 |
| 44363.5625 | 3.07 |
| 44363.572916666664 | 3.18 |
| 44363.583333333336 | 3.12 |
| 44363.59375 | 3.29 |
| 44363.604166666664 | 3.49 |
| 44363.614583333336 | 3.55 |
| 44363.625 | 3.29 |
| 44363.635416666664 | 3.69 |
| 44363.645833333336 | 3.79 |
| 44363.65625 | 3.91 |
| 44363.666666666664 | 4.06 |
| 44363.677083333336 | 4.12 |
| 44363.6875 | 3.96 |
| 44363.697916666664 | 3.89 |
| 44363.708333333336 | 3.85 |
| 44363.71875 | 3.67 |
| 44363.729166666664 | 3.45 |
| 44363.739583333336 | 3.73 |
| 44363.75 | 3.68 |
| 44363.760416666664 | 4.22 |
| 44363.770833333336 | 5.09 |
| 44363.78125 | 5.02 |
| 44363.791666666664 | 5.35 |
| 44363.802083333336 | 5.45 |
| 44363.8125 | 5.48 |
| 44363.822916666664 | 5.61 |
| 44363.833333333336 | 4.76 |
| 44363.84375 | 5.23 |
| 44363.854166666664 | 4.39 |
| 44363.864583333336 | 4.52 |
| 44363.875 | 5.06 |
| 44363.885416666664 | 5.8 |
| 44363.895833333336 | 6 |
| 44363.90625 | 6.36 |
| 44363.916666666664 | 6.49 |
| 44363.927083333336 | 6.55 |
| 44363.9375 | 6.6 |
| 44363.947916666664 | 6.75 |
| 44363.958333333336 | 6.85 |
| 44363.96875 | 6.94 |
| 44363.979166666664 | 6.88 |
| 44363.989583333336 | 6.76 |
| 44364.0 | 5.69 |
| 44364.010416666664 | 3.27 |
| 44364.020833333336 | 4.53 |
| 44364.03125 | 4.45 |
| 44364.041666666664 | 4.91 |
| 44364.052083333336 | 4.69 |
| 44364.0625 | 4.95 |
| 44364.072916666664 | 4.8 |
| 44364.083333333336 | 4.63 |
| 44364.09375 | 4.76 |
| 44364.104166666664 | 4.73 |
| 44364.114583333336 | 4.54 |
| 44364.125 | 4.57 |
| 44364.135416666664 | 4.52 |
| 44364.145833333336 | 4.19 |
| 44364.15625 | 4.24 |
| 44364.166666666664 | 4.03 |
| 44364.177083333336 | 3.91 |
| 44364.1875 | 3.79 |
| 44364.197916666664 | 3.66 |
| 44364.208333333336 | 3.47 |
| 44364.21875 | 3.27 |
| 44364.229166666664 | 3.04 |
| 44364.239583333336 | 2.86 |
| 44364.25 | 2.52 |
| 44364.260416666664 | 1.17 |
| 44364.270833333336 | 1.25 |
| 44364.28125 | 2.53 |
| 44364.291666666664 | 2.02 |
| 44364.302083333336 | 3.2 |
| 44364.3125 | 3.62 |
| 44364.322916666664 | 3.09 |
| 44364.333333333336 | 3.94 |
| 44364.34375 | 3.7 |
| 44364.354166666664 | 4.07 |
| 44364.364583333336 | 3.98 |
| 44364.375 | 4.26 |
| 44364.385416666664 | 3.99 |
| 44364.395833333336 | 4.27 |
| 44364.40625 | 4.49 |
| 44364.416666666664 | 4.51 |
| 44364.427083333336 | 4.45 |
| 44364.4375 | 4.46 |
| 44364.447916666664 | 4.51 |
| 44364.458333333336 | 4.55 |
| 44364.46875 | 4.57 |
| 44364.479166666664 | 4.64 |
| 44364.489583333336 | 4.55 |
| 44364.5 | 4.52 |
| 44364.510416666664 | 4.15 |
| 44364.520833333336 | 2.1 |
| 44364.53125 | 1.27 |
| 44364.541666666664 | 1.73 |
| 44364.552083333336 | 1.92 |
| 44364.5625 | 2.05 |
| 44364.572916666664 | 2.42 |
| 44364.583333333336 | 2.7 |
| 44364.59375 | 2.77 |
| 44364.604166666664 | 2.54 |
| 44364.614583333336 | 2.65 |
| 44364.625 | 2.98 |
| 44364.635416666664 | 3.29 |
| 44364.645833333336 | 3.41 |
| 44364.65625 | 3.56 |
| 44364.666666666664 | 3.75 |
| 44364.677083333336 | 3.93 |
| 44364.6875 | 4.08 |
| 44364.697916666664 | 3.93 |
| 44364.708333333336 | 4.08 |
| 44364.71875 | 3.91 |
| 44364.729166666664 | 3.85 |
| 44364.739583333336 | 3.79 |
| 44364.75 | 3.73 |
| 44364.760416666664 | 3.4 |
| 44364.770833333336 | 5.63 |
| 44364.78125 | 5.67 |
| 44364.791666666664 | 5.41 |
| 44364.802083333336 | 5.61 |
| 44364.8125 | 5.79 |
| 44364.822916666664 | 5.82 |
| 44364.833333333336 | 6.24 |
| 44364.84375 | 6.42 |
| 44364.854166666664 | 6.56 |
| 44364.864583333336 | 6.59 |
| 44364.875 | 6.52 |
| 44364.885416666664 | 6.61 |
| 44364.895833333336 | 6.56 |
| 44364.90625 | 6.63 |
| 44364.916666666664 | 6.72 |
| 44364.927083333336 | 6.75 |
| 44364.9375 | 6.82 |
| 44364.947916666664 | 7.14 |
| 44364.958333333336 | 7.27 |
| 44364.96875 | 7.39 |
| 44364.979166666664 | 7.61 |
| 44364.989583333336 | 7.77 |
| 44365.0 | 7.85 |
| 44365.010416666664 | 7.93 |
| 44365.020833333336 | 7.96 |
| 44365.03125 | 7.97 |
| 44365.041666666664 | 7.95 |
| 44365.052083333336 | 7.66 |
| 44365.0625 | 7.42 |
| 44365.072916666664 | 7.31 |
| 44365.083333333336 | 7.22 |
| 44365.09375 | 6.97 |
| 44365.104166666664 | 6.78 |
| 44365.114583333336 | 6.54 |
| 44365.125 | 6.28 |
| 44365.135416666664 | 6.08 |
| 44365.145833333336 | 5.94 |
| 44365.15625 | 5.83 |
| 44365.166666666664 | 5.71 |
| 44365.177083333336 | 5.6 |
| 44365.1875 | 5.52 |
| 44365.197916666664 | 5.44 |
| 44365.208333333336 | 5.37 |
| 44365.21875 | 5.31 |
| 44365.229166666664 | 5.26 |
| 44365.239583333336 | 5.22 |
| 44365.25 | 5.22 |
| 44365.260416666664 | 5.19 |
| 44365.270833333336 | 5.18 |
| 44365.28125 | 5.14 |
| 44365.291666666664 | 5.02 |
| 44365.302083333336 | 5.08 |
| 44365.3125 | 4.98 |
| 44365.322916666664 | 4.94 |
| 44365.333333333336 | 4.83 |
| 44365.34375 | 4.77 |
| 44365.354166666664 | 4.65 |
| 44365.364583333336 | 4.61 |
| 44365.375 | 4.57 |
| 44365.385416666664 | 4.53 |
| 44365.395833333336 | 4.47 |
| 44365.40625 | 4.43 |
| 44365.416666666664 | 4.54 |
| 44365.427083333336 | 4.67 |
| 44365.4375 | 4.67 |
| 44365.447916666664 | 4.71 |
| 44365.458333333336 | 4.74 |
| 44365.46875 | 4.8 |
| 44365.479166666664 | 4.84 |
| 44365.489583333336 | 4.91 |
| 44365.5 | 4.98 |
| 44365.510416666664 | 5.02 |
| 44365.520833333336 | 5.07 |
| 44365.53125 | 5.13 |
| 44365.541666666664 | 5.2 |
| 44365.552083333336 | 5.31 |
| 44365.5625 | 5.41 |
| 44365.572916666664 | 5.23 |
| 44365.583333333336 | 5.13 |
| 44365.59375 | 5.02 |
| 44365.604166666664 | 4.91 |
| 44365.614583333336 | 4.93 |
| 44365.625 | 4.98 |
| 44365.635416666664 | 4.98 |
| 44365.645833333336 | 5.07 |
| 44365.65625 | 5.24 |
| 44365.666666666664 | 5.28 |
| 44365.677083333336 | 5.36 |
| 44365.6875 | 5.46 |
| 44365.697916666664 | 5.54 |
| 44365.708333333336 | 5.62 |
| 44365.71875 | 5.64 |
| 44365.729166666664 | 5.63 |
| 44365.739583333336 | 5.65 |
| 44365.75 | 5.66 |
| 44365.760416666664 | 5.64 |
| 44365.770833333336 | 5.79 |
| 44365.78125 | 5.78 |
| 44365.791666666664 | 5.84 |
| 44365.802083333336 | 5.8 |
| 44365.8125 | 5.87 |
| 44365.822916666664 | 5.86 |
| 44365.833333333336 | 5.85 |
| 44365.84375 | 5.83 |
| 44365.854166666664 | 5.88 |
| 44365.864583333336 | 6.33 |
| 44365.875 | 6.53 |
| 44365.885416666664 | 6.66 |
| 44365.895833333336 | 6.81 |
| 44365.90625 | 6.79 |
| 44365.916666666664 | 6.69 |
| 44365.927083333336 | 6.51 |
| 44365.9375 | 6.49 |
| 44365.947916666664 | 6.48 |
| 44365.958333333336 | 6.59 |
| 44365.96875 | 6.67 |
| 44365.979166666664 | 6.83 |
| 44365.989583333336 | 6.93 |
| 44366.0 | 6.96 |
| 44366.010416666664 | 6.96 |
| 44366.020833333336 | 6.93 |
| 44366.03125 | 6.9 |
| 44366.041666666664 | 6.88 |
| 44366.052083333336 | 6.86 |
| 44366.0625 | 6.82 |
| 44366.072916666664 | 6.82 |
| 44366.083333333336 | 6.7 |
| 44366.09375 | 6.39 |
| 44366.104166666664 | 6.38 |
| 44366.114583333336 | 6.33 |
| 44366.125 | 6.26 |
| 44366.135416666664 | 6.12 |
| 44366.145833333336 | 6.06 |
| 44366.15625 | 5.96 |
| 44366.166666666664 | 5.81 |
| 44366.177083333336 | 5.76 |
| 44366.1875 | 5.73 |
| 44366.197916666664 | 5.7 |
| 44366.208333333336 | 5.67 |
| 44366.21875 | 5.65 |
| 44366.229166666664 | 5.64 |
| 44366.239583333336 | 5.65 |
| 44366.25 | 5.63 |
| 44366.260416666664 | 5.64 |
| 44366.270833333336 | 5.61 |
| 44366.28125 | 5.61 |
| 44366.291666666664 | 5.57 |
| 44366.302083333336 | 5.56 |
| 44366.3125 | 5.54 |
| 44366.322916666664 | 5.5 |
| 44366.333333333336 | 5.41 |
| 44366.34375 | 5.38 |
| 44366.354166666664 | 5.26 |
| 44366.364583333336 | 5.14 |
| 44366.375 | 5.18 |
| 44366.385416666664 | 5.43 |
| 44366.395833333336 | 5.41 |
| 44366.40625 | 5.24 |
| 44366.416666666664 | 5.13 |
| 44366.427083333336 | 5.26 |
| 44366.4375 | 5.22 |
| 44366.447916666664 | 5.12 |
| 44366.458333333336 | 5.17 |
| 44366.46875 | 5.2 |
| 44366.479166666664 | 5.09 |
| 44366.489583333336 | 5.05 |
| 44366.5 | 4.99 |
| 44366.510416666664 | 4.96 |
| 44366.520833333336 | 5 |
| 44366.53125 | 5.01 |
| 44366.541666666664 | 5.06 |
| 44366.552083333336 | 5.11 |
| 44366.5625 | 5.18 |
| 44366.572916666664 | 5.28 |
| 44366.583333333336 | 5.35 |
| 44366.59375 | 5.26 |
| 44366.604166666664 | 5.24 |
| 44366.614583333336 | 5.28 |
| 44366.625 | 5.22 |
| 44366.635416666664 | 5.07 |
| 44366.645833333336 | 5.08 |
| 44366.65625 | 5.15 |
| 44366.666666666664 | 5.29 |
| 44366.677083333336 | 5.47 |
| 44366.6875 | 5.61 |
| 44366.697916666664 | 5.63 |
| 44366.708333333336 | 5.79 |
| 44366.71875 | 6.06 |
| 44366.729166666664 | 6.21 |
| 44366.739583333336 | 6.29 |
| 44366.75 | 6.26 |
| 44366.760416666664 | 6.18 |
| 44366.770833333336 | 6.15 |
| 44366.78125 | 6.14 |
| 44366.791666666664 | 6.1 |
| 44366.802083333336 | 6.08 |
| 44366.8125 | 6.03 |
| 44366.822916666664 | 6.02 |
| 44366.833333333336 | 6.01 |
| 44366.84375 | 6.01 |
| 44366.854166666664 | 5.97 |
| 44366.864583333336 | 5.95 |
| 44366.875 | 5.86 |
| 44366.885416666664 | 5.83 |
| 44366.895833333336 | 6.12 |
| 44366.90625 | 6.66 |
| 44366.916666666664 | 6.6 |
| 44366.927083333336 | 6.37 |
| 44366.9375 | 6.82 |
| 44366.947916666664 | 6.53 |
| 44366.958333333336 | 6.35 |
| 44366.96875 | 6.24 |
| 44366.979166666664 | 6.02 |
| 44366.989583333336 | 6.04 |
| 44367.0 | 6.23 |
| 44367.010416666664 | 6.15 |
| 44367.020833333336 | 6.35 |
| 44367.03125 | 6.67 |
| 44367.041666666664 | 6.72 |
| 44367.052083333336 | 6.68 |
| 44367.0625 | 6.63 |
| 44367.072916666664 | 6.55 |
| 44367.083333333336 | 6.71 |
| 44367.09375 | 6.77 |
| 44367.104166666664 | 6.64 |
| 44367.114583333336 | 6.66 |
| 44367.125 | 6.73 |
| 44367.135416666664 | 6.3 |
| 44367.145833333336 | 6.24 |
| 44367.15625 | 6.22 |
| 44367.166666666664 | 6.15 |
| 44367.177083333336 | 6 |
| 44367.1875 | 5.94 |
| 44367.197916666664 | 5.83 |
| 44367.208333333336 | 5.67 |
| 44367.21875 | 5.55 |
| 44367.229166666664 | 5.45 |
| 44367.239583333336 | 5.33 |
| 44367.25 | 5.24 |
| 44367.260416666664 | 5.14 |
| 44367.270833333336 | 5.05 |
| 44367.28125 | 4.97 |
| 44367.291666666664 | 4.92 |
| 44367.302083333336 | 4.88 |
| 44367.3125 | 4.9 |
| 44367.322916666664 | 4.94 |
| 44367.333333333336 | 4.96 |
| 44367.34375 | 4.97 |
| 44367.354166666664 | 4.98 |
| 44367.364583333336 | 4.91 |
| 44367.375 | 4.76 |
| 44367.385416666664 | 4.7 |
| 44367.395833333336 | 4.67 |
| 44367.40625 | 4.55 |
| 44367.416666666664 | 4.58 |
| 44367.427083333336 | 4.48 |
| 44367.4375 | 4.24 |
| 44367.447916666664 | 4.28 |
| 44367.458333333336 | 4.02 |
| 44367.46875 | 4.01 |
| 44367.479166666664 | 3.99 |
| 44367.489583333336 | 4 |
| 44367.5 | 4.12 |
| 44367.510416666664 | 4.24 |
| 44367.520833333336 | 4.26 |
| 44367.53125 | 4.36 |
| 44367.541666666664 | 4.45 |
| 44367.552083333336 | 4.53 |
| 44367.5625 | 4.56 |
| 44367.572916666664 | 4.76 |
| 44367.583333333336 | 4.87 |
| 44367.59375 | 5.03 |
| 44367.604166666664 | 5.12 |
| 44367.614583333336 | 5.16 |
| 44367.625 | 5.56 |
| 44367.635416666664 | 5.27 |
| 44367.645833333336 | 5.14 |
| 44367.65625 | 5 |
| 44367.666666666664 | 4.86 |
| 44367.677083333336 | 4.82 |
| 44367.6875 | 4.83 |
| 44367.697916666664 | 4.97 |
| 44367.708333333336 | 5.2 |
| 44367.71875 | 5.28 |
| 44367.729166666664 | 5.27 |
| 44367.739583333336 | 5.35 |
| 44367.75 | 5.55 |
| 44367.760416666664 | 5.64 |
| 44367.770833333336 | 5.66 |
| 44367.78125 | 5.66 |
| 44367.791666666664 | 5.7 |
| 44367.802083333336 | 5.79 |
| 44367.8125 | 5.76 |
| 44367.822916666664 | 5.75 |
| 44367.833333333336 | 5.75 |
| 44367.84375 | 5.72 |
| 44367.854166666664 | 5.7 |
| 44367.864583333336 | 5.68 |
| 44367.875 | 5.65 |
| 44367.885416666664 | 5.61 |
| 44367.895833333336 | 5.6 |
| 44367.90625 | 5.54 |
| 44367.916666666664 | 5.36 |
| 44367.927083333336 | 5.58 |
| 44367.9375 | 5.6 |
| 44367.947916666664 | 5.7 |
| 44367.958333333336 | 5.97 |
| 44367.96875 | 6.02 |
| 44367.979166666664 | 5.99 |
| 44367.989583333336 | 5.9 |
| 44368.0 | 5.68 |
| 44368.010416666664 | 5.6 |
| 44368.020833333336 | 5.43 |
| 44368.03125 | 5.11 |
| 44368.041666666664 | 5.37 |
| 44368.052083333336 | 5.54 |
| 44368.0625 | 5.6 |
| 44368.072916666664 | 5.6 |
| 44368.083333333336 | 5.55 |
| 44368.09375 | 5.49 |
| 44368.104166666664 | 5.52 |
| 44368.114583333336 | 5.51 |
| 44368.125 | 5.51 |
| 44368.135416666664 | 5.48 |
| 44368.145833333336 | 5.38 |
| 44368.15625 | 5.34 |
| 44368.166666666664 | 5.36 |
| 44368.177083333336 | 5.11 |
| 44368.1875 | 5.07 |
| 44368.197916666664 | 5.06 |
| 44368.208333333336 | 4.99 |
| 44368.21875 | 4.95 |
| 44368.229166666664 | 4.99 |
| 44368.239583333336 | 4.97 |
| 44368.25 | 4.96 |
| 44368.260416666664 | 4.97 |
| 44368.270833333336 | 4.94 |
| 44368.28125 | 4.95 |
| 44368.291666666664 | 4.94 |
| 44368.302083333336 | 4.94 |
| 44368.3125 | 4.97 |
| 44368.322916666664 | 4.98 |
| 44368.333333333336 | 4.97 |
| 44368.34375 | 4.99 |
| 44368.354166666664 | 5 |
| 44368.364583333336 | 4.98 |
| 44368.375 | 4.97 |
| 44368.385416666664 | 4.94 |
| 44368.395833333336 | 4.91 |
| 44368.40625 | 4.97 |
| 44368.416666666664 | 4.98 |
| 44368.427083333336 | 4.89 |
| 44368.4375 | 4.66 |
| 44368.447916666664 | 4.59 |
| 44368.458333333336 | 4.56 |
| 44368.46875 | 4.74 |
| 44368.479166666664 | 4.9 |
| 44368.489583333336 | 4.79 |
| 44368.5 | 4.71 |
| 44368.510416666664 | 4.55 |
| 44368.520833333336 | 4.51 |
| 44368.53125 | 4.27 |
| 44368.541666666664 | 4.44 |
| 44368.552083333336 | 4.45 |
| 44368.5625 | 4.47 |
| 44368.572916666664 | 4.52 |
| 44368.583333333336 | 4.52 |
| 44368.59375 | 4.53 |
| 44368.604166666664 | 4.55 |
| 44368.614583333336 | 4.61 |
| 44368.625 | 4.65 |
| 44368.635416666664 | 4.74 |
| 44368.645833333336 | 4.72 |
| 44368.65625 | 4.83 |
| 44368.666666666664 | 4.85 |
| 44368.677083333336 | 4.71 |
| 44368.6875 | 4.61 |
| 44368.697916666664 | 4.63 |
| 44368.708333333336 | 4.6 |
| 44368.71875 | 4.66 |
| 44368.729166666664 | 4.79 |
| 44368.739583333336 | 4.97 |
| 44368.75 | 5.05 |
| 44368.760416666664 | 5.12 |
| 44368.770833333336 | 5.31 |
| 44368.78125 | 5.38 |
| 44368.791666666664 | 5.55 |
| 44368.802083333336 | 5.59 |
| 44368.8125 | 5.6 |
| 44368.822916666664 | 5.6 |
| 44368.833333333336 | 5.57 |
| 44368.84375 | 5.55 |
| 44368.854166666664 | 5.52 |
| 44368.864583333336 | 5.47 |
| 44368.875 | 5.45 |
| 44368.885416666664 | 5.4 |
| 44368.895833333336 | 5.42 |
| 44368.90625 | 5.45 |
| 44368.916666666664 | 5.42 |
| 44368.927083333336 | 5.44 |
| 44368.9375 | 5.4 |
| 44368.947916666664 | 5.26 |
| 44368.958333333336 | 5.2 |
| 44368.96875 | 4.98 |
| 44368.979166666664 | 5.17 |
| 44368.989583333336 | 5.26 |
| 44369.0 | 5.26 |
| 44369.010416666664 | 5.51 |
| 44369.020833333336 | 5.48 |
| 44369.03125 | 5.29 |
| 44369.041666666664 | 5.03 |
| 44369.052083333336 | 5.09 |
| 44369.0625 | 4.99 |
| 44369.072916666664 | 4.76 |
| 44369.083333333336 | 4.49 |
| 44369.09375 | 4.45 |
| 44369.104166666664 | 4.42 |
| 44369.114583333336 | 4.46 |
| 44369.125 | 4.59 |
| 44369.135416666664 | 4.54 |
| 44369.145833333336 | 4.68 |
| 44369.15625 | 4.68 |
| 44369.166666666664 | 4.83 |
| 44369.177083333336 | 4.79 |
| 44369.1875 | 4.77 |
| 44369.197916666664 | 4.87 |
| 44369.208333333336 | 4.79 |
| 44369.21875 | 4.66 |
| 44369.229166666664 | 4.49 |
| 44369.239583333336 | 4.46 |
| 44369.25 | 4.4 |
| 44369.260416666664 | 4.32 |
| 44369.270833333336 | 4.32 |
| 44369.28125 | 4.32 |
| 44369.291666666664 | 4.3 |
| 44369.302083333336 | 4.34 |
| 44369.3125 | 4.33 |
| 44369.322916666664 | 4.33 |
| 44369.333333333336 | 4.31 |
| 44369.34375 | 4.32 |
| 44369.354166666664 | 4.29 |
| 44369.364583333336 | 4.33 |
| 44369.375 | 4.34 |
| 44369.385416666664 | 4.37 |
| 44369.395833333336 | 4.37 |
| 44369.40625 | 4.44 |
| 44369.416666666664 | 4.45 |
| 44369.427083333336 | 4.43 |
| 44369.4375 | 4.44 |
| 44369.447916666664 | 4.42 |
| 44369.458333333336 | 4.31 |
| 44369.46875 | 4.39 |
| 44369.479166666664 | 4.32 |
| 44369.489583333336 | 4.34 |
| 44369.5 | 4.39 |
| 44369.510416666664 | 4.27 |
| 44369.520833333336 | 4.34 |
| 44369.53125 | 4.45 |
| 44369.541666666664 | 4.32 |
| 44369.552083333336 | 4.33 |
| 44369.5625 | 4.39 |
| 44369.572916666664 | 4.53 |
| 44369.583333333336 | 4.47 |
| 44369.59375 | 4.54 |
| 44369.604166666664 | 4.64 |
| 44369.614583333336 | 4.71 |
| 44369.625 | 4.76 |
| 44369.635416666664 | 4.78 |
| 44369.645833333336 | 4.86 |
| 44369.65625 | 4.89 |
| 44369.666666666664 | 4.94 |
| 44369.677083333336 | 5.09 |
| 44369.6875 | 5.29 |
| 44369.697916666664 | 5.48 |
| 44369.708333333336 | 5.63 |
| 44369.71875 | 5.22 |
| 44369.729166666664 | 5.03 |
| 44369.739583333336 | 4.77 |
| 44369.75 | 4.57 |
| 44369.760416666664 | 4.61 |
| 44369.770833333336 | 4.67 |
| 44369.78125 | 4.81 |
| 44369.791666666664 | 4.89 |
| 44369.802083333336 | 4.93 |
| 44369.8125 | 5.04 |
| 44369.822916666664 | 5.18 |
| 44369.833333333336 | 5.3 |
| 44369.84375 | 5.39 |
| 44369.854166666664 | 5.45 |
| 44369.864583333336 | 5.51 |
| 44369.875 | 5.5 |
| 44369.885416666664 | 5.51 |
| 44369.895833333336 | 5.48 |
| 44369.90625 | 5.46 |
| 44369.916666666664 | 5.43 |
| 44369.927083333336 | 5.41 |
| 44369.9375 | 5.36 |
| 44369.947916666664 | 5.33 |
| 44369.958333333336 | 5.29 |
| 44369.96875 | 5.24 |
| 44369.979166666664 | 5.17 |
| 44369.989583333336 | 5.11 |
| 44370.0 | 5.08 |
| 44370.010416666664 | 4.99 |
| 44370.020833333336 | 5 |
| 44370.03125 | 4.97 |
| 44370.041666666664 | 4.98 |
| 44370.052083333336 | 4.83 |
| 44370.0625 | 4.85 |
| 44370.072916666664 | 4.74 |
| 44370.083333333336 | 4.77 |
| 44370.09375 | 4.54 |
| 44370.104166666664 | 4.38 |
| 44370.114583333336 | 4.4 |
| 44370.125 | 4.02 |
| 44370.135416666664 | 4.1 |
| 44370.145833333336 | 4.01 |
| 44370.15625 | 3.78 |
| 44370.166666666664 | 3.85 |
| 44370.177083333336 | 3.87 |
| 44370.1875 | 3.84 |
| 44370.197916666664 | 3.77 |
| 44370.208333333336 | 3.72 |
| 44370.21875 | 3.68 |
| 44370.229166666664 | 3.58 |
| 44370.239583333336 | 3.48 |
| 44370.25 | 3.38 |
| 44370.260416666664 | 3.36 |
| 44370.270833333336 | 3.38 |
| 44370.28125 | 3.4 |
| 44370.291666666664 | 3.46 |
| 44370.302083333336 | 3.53 |
| 44370.3125 | 3.67 |
| 44370.322916666664 | 3.74 |
| 44370.333333333336 | 3.82 |
| 44370.34375 | 3.88 |
| 44370.354166666664 | 3.91 |
| 44370.364583333336 | 3.95 |
| 44370.375 | 4 |
| 44370.385416666664 | 4.04 |
| 44370.395833333336 | 4.05 |
| 44370.40625 | 4.11 |
| 44370.416666666664 | 4.18 |
| 44370.427083333336 | 4.24 |
| 44370.4375 | 4.33 |
| 44370.447916666664 | 4.36 |
| 44370.458333333336 | 4.41 |
| 44370.46875 | 4.46 |
| 44370.479166666664 | 4.5 |
| 44370.489583333336 | 4.53 |
| 44370.5 | 4.51 |
| 44370.510416666664 | 4.49 |
| 44370.520833333336 | 4.38 |
| 44370.53125 | 4.52 |
| 44370.541666666664 | 4.54 |
| 44370.552083333336 | 4.61 |
| 44370.5625 | 4.67 |
| 44370.572916666664 | 4.72 |
| 44370.583333333336 | 4.68 |
| 44370.59375 | 4.82 |
| 44370.604166666664 | 5.04 |
| 44370.614583333336 | 5.15 |
| 44370.625 | 5.14 |
| 44370.635416666664 | 5.21 |
| 44370.645833333336 | 5.23 |
| 44370.65625 | 5.3 |
| 44370.666666666664 | 5.28 |
| 44370.677083333336 | 5.39 |
| 44370.6875 | 5.37 |
| 44370.697916666664 | 5.46 |
| 44370.708333333336 | 5.47 |
| 44370.71875 | 5.53 |
| 44370.729166666664 | 5.69 |
| 44370.739583333336 | 5.8 |
| 44370.75 | 5.77 |
| 44370.760416666664 | 5.98 |
| 44370.770833333336 | 5.98 |
| 44370.78125 | 5.96 |
| 44370.791666666664 | 5.94 |
| 44370.802083333336 | 5.8 |
| 44370.8125 | 5.76 |
| 44370.822916666664 | 5.75 |
| 44370.833333333336 | 5.8 |
| 44370.84375 | 5.85 |
| 44370.854166666664 | 5.81 |
| 44370.864583333336 | 5.78 |
| 44370.875 | 5.85 |
| 44370.885416666664 | 5.87 |
| 44370.895833333336 | 5.88 |
| 44370.90625 | 5.82 |
| 44370.916666666664 | 5.73 |
| 44370.927083333336 | 5.69 |
| 44370.9375 | 5.68 |
| 44370.947916666664 | 5.69 |
| 44370.958333333336 | 5.66 |
| 44370.96875 | 5.6 |
| 44370.979166666664 | 5.54 |
| 44370.989583333336 | 5.52 |
| 44371.0 | 5.47 |
| 44371.010416666664 | 5.43 |
| 44371.020833333336 | 5.38 |
| 44371.03125 | 5.37 |
| 44371.041666666664 | 5.38 |
| 44371.052083333336 | 5.37 |
| 44371.0625 | 5.35 |
| 44371.072916666664 | 5.26 |
| 44371.083333333336 | 5.29 |
| 44371.09375 | 5.3 |
| 44371.104166666664 | 5.21 |
| 44371.114583333336 | 5.15 |
| 44371.125 | 5.05 |
| 44371.135416666664 | 4.91 |
| 44371.145833333336 | 4.77 |
| 44371.15625 | 4.66 |
| 44371.166666666664 | 4.6 |
| 44371.177083333336 | 4.41 |
| 44371.1875 | 4.44 |
| 44371.197916666664 | 4.63 |
| 44371.208333333336 | 4.57 |
| 44371.21875 | 4.76 |
| 44371.229166666664 | 4.81 |
| 44371.239583333336 | 4.75 |
| 44371.25 | 4.69 |
| 44371.260416666664 | 4.57 |
| 44371.270833333336 | 4.47 |
| 44371.28125 | 4.38 |
| 44371.291666666664 | 4.31 |
| 44371.302083333336 | 4.02 |
| 44371.3125 | 4.18 |
| 44371.322916666664 | 4.17 |
| 44371.333333333336 | 4.18 |
| 44371.34375 | 4.21 |
| 44371.354166666664 | 4.25 |
| 44371.364583333336 | 4.35 |
| 44371.375 | 4.37 |
| 44371.385416666664 | 4.4 |
| 44371.395833333336 | 4.4 |
| 44371.40625 | 4.4 |
| 44371.416666666664 | 4.4 |
| 44371.427083333336 | 4.42 |
| 44371.4375 | 4.45 |
| 44371.447916666664 | 4.47 |
| 44371.458333333336 | 4.54 |
| 44371.46875 | 4.6 |
| 44371.479166666664 | 4.64 |
| 44371.489583333336 | 4.68 |
| 44371.5 | 4.73 |
| 44371.510416666664 | 4.75 |
| 44371.520833333336 | 4.79 |
| 44371.53125 | 4.81 |
| 44371.541666666664 | 4.72 |
| 44371.552083333336 | 4.79 |
| 44371.5625 | 4.9 |
| 44371.572916666664 | 5.16 |
| 44371.583333333336 | 5.24 |
| 44371.59375 | 5.36 |
| 44371.604166666664 | 5.53 |
| 44371.614583333336 | 5.7 |
| 44371.625 | 6.02 |
| 44371.635416666664 | 5.97 |
| 44371.645833333336 | 6.05 |
| 44371.65625 | 6.09 |
| 44371.666666666664 | 6.22 |
| 44371.677083333336 | 6.24 |
| 44371.6875 | 6.26 |
| 44371.697916666664 | 6.4 |
| 44371.708333333336 | 6.41 |
| 44371.71875 | 6.35 |
| 44371.729166666664 | 6.32 |
| 44371.739583333336 | 6.43 |
| 44371.75 | 6.51 |
| 44371.760416666664 | 6.64 |
| 44371.770833333336 | 6.61 |
| 44371.78125 | 6.48 |
| 44371.791666666664 | 6.53 |
| 44371.802083333336 | 6.49 |
| 44371.8125 | 6.7 |
| 44371.822916666664 | 6.73 |
| 44371.833333333336 | 6.81 |
| 44371.84375 | 6.77 |
| 44371.854166666664 | 6.75 |
| 44371.864583333336 | 6.73 |
| 44371.875 | 6.75 |
| 44371.885416666664 | 6.69 |
| 44371.895833333336 | 6.64 |
| 44371.90625 | 6.62 |
| 44371.916666666664 | 6.59 |
| 44371.927083333336 | 6.53 |
| 44371.9375 | 6.48 |
| 44371.947916666664 | 6.46 |
| 44371.958333333336 | 6.43 |
| 44371.96875 | 6.4 |
| 44371.979166666664 | 6.41 |
| 44371.989583333336 | 6.44 |
| 44372.0 | 6.44 |
| 44372.010416666664 | 6.43 |
| 44372.020833333336 | 6.37 |
| 44372.03125 | 6.35 |
| 44372.041666666664 | 6.3 |
| 44372.052083333336 | 6.25 |
| 44372.0625 | 6.19 |
| 44372.072916666664 | 6.03 |
| 44372.083333333336 | 6.07 |
| 44372.09375 | 6.06 |
| 44372.104166666664 | 5.99 |
| 44372.114583333336 | 5.95 |
| 44372.125 | 5.92 |
| 44372.135416666664 | 5.91 |
| 44372.145833333336 | 5.83 |
| 44372.15625 | 5.64 |
| 44372.166666666664 | 5.67 |
| 44372.177083333336 | 5.48 |
| 44372.1875 | 5.31 |
| 44372.197916666664 | 5.25 |
| 44372.208333333336 | 5.1 |
| 44372.21875 | 5.12 |
| 44372.229166666664 | 5.1 |
| 44372.239583333336 | 5.07 |
| 44372.25 | 4.99 |
| 44372.260416666664 | 5.06 |
| 44372.270833333336 | 5.1 |
| 44372.28125 | 4.95 |
| 44372.291666666664 | 4.91 |
| 44372.302083333336 | 4.8 |
| 44372.3125 | 4.65 |
| 44372.322916666664 | 4.51 |
| 44372.333333333336 | 4.41 |
| 44372.34375 | 4.15 |
| 44372.354166666664 | 4.37 |
| 44372.364583333336 | 4.36 |
| 44372.375 | 4.4 |
| 44372.385416666664 | 4.45 |
| 44372.395833333336 | 4.53 |
| 44372.40625 | 4.63 |
| 44372.416666666664 | 4.68 |
| 44372.427083333336 | 4.75 |
| 44372.4375 | 4.82 |
| 44372.447916666664 | 4.81 |
| 44372.458333333336 | 4.85 |
| 44372.46875 | 4.89 |
| 44372.479166666664 | 4.93 |
| 44372.489583333336 | 5.02 |
| 44372.5 | 5.1 |
| 44372.510416666664 | 5.19 |
| 44372.520833333336 | 5.28 |
| 44372.53125 | 5.46 |
| 44372.541666666664 | 5.36 |
| 44372.552083333336 | 5.4 |
| 44372.5625 | 5.24 |
| 44372.572916666664 | 5.21 |
| 44372.583333333336 | 5.2 |
| 44372.59375 | 5.31 |
| 44372.604166666664 | 5.5 |
| 44372.614583333336 | 5.55 |
| 44372.625 | 5.65 |
| 44372.635416666664 | 5.79 |
| 44372.645833333336 | 5.9 |
| 44372.65625 | 5.99 |
| 44372.666666666664 | 5.92 |
| 44372.677083333336 | 6.04 |
| 44372.6875 | 6.15 |
| 44372.697916666664 | 6.15 |
| 44372.708333333336 | 6.2 |
| 44372.71875 | 6.28 |
| 44372.729166666664 | 6.33 |
| 44372.739583333336 | 6.52 |
| 44372.75 | 6.63 |
| 44372.760416666664 | 6.71 |
| 44372.770833333336 | 6.74 |
| 44372.78125 | 6.89 |
| 44372.791666666664 | 7.04 |
| 44372.802083333336 | 7.25 |
| 44372.8125 | 7.42 |
| 44372.822916666664 | 7.28 |
| 44372.833333333336 | 7.34 |
| 44372.84375 | 7.4 |
| 44372.854166666664 | 7.29 |
| 44372.864583333336 | 7.16 |
| 44372.875 | 6.96 |
| 44372.885416666664 | 6.84 |
| 44372.895833333336 | 6.86 |
| 44372.90625 | 6.92 |
| 44372.916666666664 | 6.85 |
| 44372.927083333336 | 6.77 |
| 44372.9375 | 6.68 |
| 44372.947916666664 | 6.55 |
| 44372.958333333336 | 6.55 |
| 44372.96875 | 6.51 |
| 44372.979166666664 | 6.42 |
| 44372.989583333336 | 6.33 |
| 44373.0 | 6.29 |
| 44373.010416666664 | 6.28 |
| 44373.020833333336 | 6.27 |
| 44373.03125 | 6.25 |
| 44373.041666666664 | 6.15 |
| 44373.052083333336 | 6.06 |
| 44373.0625 | 5.96 |
| 44373.072916666664 | 5.86 |
| 44373.083333333336 | 5.73 |
| 44373.09375 | 5.66 |
| 44373.104166666664 | 5.66 |
| 44373.114583333336 | 5.53 |
| 44373.125 | 5.7 |
| 44373.135416666664 | 5.74 |
| 44373.145833333336 | 5.66 |
| 44373.15625 | 5.56 |
| 44373.166666666664 | 5.54 |
| 44373.177083333336 | 5.4 |
| 44373.1875 | 5.29 |
| 44373.197916666664 | 5.08 |
| 44373.208333333336 | 4.91 |
| 44373.21875 | 4.74 |
| 44373.229166666664 | 4.64 |
| 44373.239583333336 | 4.44 |
| 44373.25 | 4.62 |
| 44373.260416666664 | 4.4 |
| 44373.270833333336 | 4.44 |
| 44373.28125 | 4.7 |
| 44373.291666666664 | 4.83 |
| 44373.302083333336 | 4.85 |
| 44373.3125 | 4.84 |
| 44373.322916666664 | 4.78 |
| 44373.333333333336 | 4.74 |
| 44373.34375 | 4.63 |
| 44373.354166666664 | 4.51 |
| 44373.364583333336 | 4.42 |
| 44373.375 | 4.34 |
| 44373.385416666664 | 4.3 |
| 44373.395833333336 | 4.29 |
| 44373.40625 | 4.32 |
| 44373.416666666664 | 4.31 |
| 44373.427083333336 | 4.35 |
| 44373.4375 | 4.48 |
| 44373.447916666664 | 4.46 |
| 44373.458333333336 | 4.53 |
| 44373.46875 | 4.53 |
| 44373.479166666664 | 4.58 |
| 44373.489583333336 | 4.61 |
| 44373.5 | 4.71 |
| 44373.510416666664 | 4.76 |
| 44373.520833333336 | 4.74 |
| 44373.53125 | 4.81 |
| 44373.541666666664 | 4.97 |
| 44373.552083333336 | 5.08 |
| 44373.5625 | 5.14 |
| 44373.572916666664 | 5.17 |
| 44373.583333333336 | 5.28 |
| 44373.59375 | 5.26 |
| 44373.604166666664 | 5.23 |
| 44373.614583333336 | 5.22 |
| 44373.625 | 5.02 |
| 44373.635416666664 | 5.06 |
| 44373.645833333336 | 5.49 |
| 44373.65625 | 5.85 |
| 44373.666666666664 | 6.05 |
| 44373.677083333336 | 6.08 |
| 44373.6875 | 6.21 |
| 44373.697916666664 | 6.46 |
| 44373.708333333336 | 6.51 |
| 44373.71875 | 6.48 |
| 44373.729166666664 | 6.49 |
| 44373.739583333336 | 6.46 |
| 44373.75 | 6.59 |
| 44373.760416666664 | 6.66 |
| 44373.770833333336 | 6.63 |
| 44373.78125 | 6.62 |
| 44373.791666666664 | 6.69 |
| 44373.802083333336 | 6.84 |
| 44373.8125 | 6.99 |
| 44373.822916666664 | 7.11 |
| 44373.833333333336 | 7.23 |
| 44373.84375 | 7.39 |
| 44373.854166666664 | 7.6 |
| 44373.864583333336 | 7.64 |
| 44373.875 | 7.6 |
| 44373.885416666664 | 7.4 |
| 44373.895833333336 | 7.06 |
| 44373.90625 | 6.74 |
| 44373.916666666664 | 6.63 |
| 44373.927083333336 | 6.51 |
| 44373.9375 | 6.32 |
| 44373.947916666664 | 6.21 |
| 44373.958333333336 | 6.14 |
| 44373.96875 | 6.08 |
| 44373.979166666664 | 5.97 |
| 44373.989583333336 | 5.94 |
| 44374.0 | 5.9 |
| 44374.010416666664 | 5.88 |
| 44374.020833333336 | 5.91 |
| 44374.03125 | 5.85 |
| 44374.041666666664 | 5.89 |
| 44374.052083333336 | 5.87 |
| 44374.0625 | 5.8 |
| 44374.072916666664 | 5.79 |
| 44374.083333333336 | 5.78 |
| 44374.09375 | 5.68 |
| 44374.104166666664 | 5.63 |
| 44374.114583333336 | 5.59 |
| 44374.125 | 5.62 |
| 44374.135416666664 | 5.55 |
| 44374.145833333336 | 5.47 |
| 44374.15625 | 5.33 |
| 44374.166666666664 | 5.36 |
| 44374.177083333336 | 5.34 |
| 44374.1875 | 5.45 |
| 44374.197916666664 | 5.4 |
| 44374.208333333336 | 5.43 |
| 44374.21875 | 5.15 |
| 44374.229166666664 | 5 |
| 44374.239583333336 | 4.83 |
| 44374.25 | 4.61 |
| 44374.260416666664 | 4.4 |
| 44374.270833333336 | 4.47 |
| 44374.28125 | 4.4 |
| 44374.291666666664 | 4.44 |
| 44374.302083333336 | 4.55 |
| 44374.3125 | 4.49 |
| 44374.322916666664 | 4.44 |
| 44374.333333333336 | 4.42 |
| 44374.34375 | 4.35 |
| 44374.354166666664 | 4.31 |
| 44374.364583333336 | 4.22 |
| 44374.375 | 4.09 |
| 44374.385416666664 | 4 |
| 44374.395833333336 | 3.91 |
| 44374.40625 | 3.82 |
| 44374.416666666664 | 3.8 |
| 44374.427083333336 | 3.78 |
| 44374.4375 | 3.73 |
| 44374.447916666664 | 3.7 |
| 44374.458333333336 | 3.77 |
| 44374.46875 | 3.92 |
| 44374.479166666664 | 4.01 |
| 44374.489583333336 | 4.06 |
| 44374.5 | 4.14 |
| 44374.510416666664 | 4.22 |
| 44374.520833333336 | 4.27 |
| 44374.53125 | 4.34 |
| 44374.541666666664 | 4.44 |
| 44374.552083333336 | 4.46 |
| 44374.5625 | 4.56 |
| 44374.572916666664 | 4.69 |
| 44374.583333333336 | 4.76 |
| 44374.59375 | 4.92 |
| 44374.604166666664 | 4.99 |
| 44374.614583333336 | 5.07 |
| 44374.625 | 5.25 |
| 44374.635416666664 | 5.19 |
| 44374.645833333336 | 5.21 |
| 44374.65625 | 5.26 |
| 44374.666666666664 | 5.03 |
| 44374.677083333336 | 5.19 |
| 44374.6875 | 5.81 |
| 44374.697916666664 | 5.94 |
| 44374.708333333336 | 6.13 |
| 44374.71875 | 6.31 |
| 44374.729166666664 | 6.43 |
| 44374.739583333336 | 6.41 |
| 44374.75 | 6.34 |
| 44374.760416666664 | 6.28 |
| 44374.770833333336 | 6.34 |
| 44374.78125 | 6.46 |
| 44374.791666666664 | 6.62 |
| 44374.802083333336 | 6.62 |
| 44374.8125 | 6.72 |
| 44374.822916666664 | 6.88 |
| 44374.833333333336 | 7.05 |
| 44374.84375 | 7.28 |
| 44374.854166666664 | 7.45 |
| 44374.864583333336 | 7.65 |
| 44374.875 | 7.75 |
| 44374.885416666664 | 7.87 |
| 44374.895833333336 | 7.93 |
| 44374.90625 | 7.89 |
| 44374.916666666664 | 7.65 |
| 44374.927083333336 | 7.44 |
| 44374.9375 | 7.22 |
| 44374.947916666664 | 6.89 |
| 44374.958333333336 | 6.69 |
| 44374.96875 | 6.48 |
| 44374.979166666664 | 6.23 |
| 44374.989583333336 | 6.09 |
| 44375.0 | 6.01 |
| 44375.010416666664 | 5.91 |
| 44375.020833333336 | 5.82 |
| 44375.03125 | 5.76 |
| 44375.041666666664 | 5.73 |
| 44375.052083333336 | 5.75 |
| 44375.0625 | 5.72 |
| 44375.072916666664 | 5.75 |
| 44375.083333333336 | 5.71 |
| 44375.09375 | 5.69 |
| 44375.104166666664 | 5.7 |
| 44375.114583333336 | 5.7 |
| 44375.125 | 5.71 |
| 44375.135416666664 | 5.66 |
| 44375.145833333336 | 5.65 |
| 44375.15625 | 5.5 |
| 44375.166666666664 | 5.57 |
| 44375.177083333336 | 5.38 |
| 44375.1875 | 5.15 |
| 44375.197916666664 | 5.17 |
| 44375.208333333336 | 5.27 |
| 44375.21875 | 5.53 |
| 44375.229166666664 | 5.56 |
| 44375.239583333336 | 5.34 |
| 44375.25 | 5.1 |
| 44375.260416666664 | 5.07 |
| 44375.270833333336 | 4.73 |
| 44375.28125 | 4.83 |
| 44375.291666666664 | 4.53 |
| 44375.302083333336 | 4.56 |
| 44375.3125 | 4.65 |
| 44375.322916666664 | 4.56 |
| 44375.333333333336 | 4.47 |
| 44375.34375 | 4.43 |
| 44375.354166666664 | 4.28 |
| 44375.364583333336 | 4.27 |
| 44375.375 | 4.26 |
| 44375.385416666664 | 4.25 |
| 44375.395833333336 | 4.12 |
| 44375.40625 | 4.01 |
| 44375.416666666664 | 4 |
| 44375.427083333336 | 3.93 |
| 44375.4375 | 2.82 |
| 44375.447916666664 | 3.8 |
| 44375.458333333336 | 3.7 |
| 44375.46875 | 3.73 |
| 44375.479166666664 | 3.73 |
| 44375.489583333336 | 3.69 |
| 44375.5 | 3.82 |
| 44375.510416666664 | 3.92 |
| 44375.520833333336 | 3.98 |
| 44375.53125 | 4.01 |
| 44375.541666666664 | 4.1 |
| 44375.552083333336 | 4.12 |
| 44375.5625 | 4.19 |
| 44375.572916666664 | 4.29 |
| 44375.583333333336 | 4.33 |
| 44375.59375 | 4.45 |
| 44375.604166666664 | 4.65 |
| 44375.614583333336 | 4.82 |
| 44375.625 | 4.98 |
| 44375.635416666664 | 5.1 |
| 44375.645833333336 | 5.21 |
| 44375.65625 | 5.26 |
| 44375.666666666664 | 5.3 |
| 44375.677083333336 | 5.19 |
| 44375.6875 | 5.2 |
| 44375.697916666664 | 4.92 |
| 44375.708333333336 | 5.35 |
| 44375.71875 | 5.66 |
| 44375.729166666664 | 6.08 |
| 44375.739583333336 | 6.17 |
| 44375.75 | 6.34 |
| 44375.760416666664 | 6.17 |
| 44375.770833333336 | 6.3 |
| 44375.78125 | 6.22 |
| 44375.791666666664 | 6.24 |
| 44375.802083333336 | 6.24 |
| 44375.8125 | 6.44 |
| 44375.822916666664 | 6.71 |
| 44375.833333333336 | 6.76 |
| 44375.84375 | 6.85 |
| 44375.854166666664 | 6.89 |
| 44375.864583333336 | 7.01 |
| 44375.875 | 7.14 |
| 44375.885416666664 | 7.27 |
| 44375.895833333336 | 7.37 |
| 44375.90625 | 7.44 |
| 44375.916666666664 | 7.54 |
| 44375.927083333336 | 7.51 |
| 44375.9375 | 7.31 |
| 44375.947916666664 | 7.27 |
| 44375.958333333336 | 6.93 |
| 44375.96875 | 6.81 |
| 44375.979166666664 | 6.65 |
| 44375.989583333336 | 6.34 |
| 44376.0 | 6.25 |
| 44376.010416666664 | 6.09 |
| 44376.020833333336 | 5.98 |
| 44376.03125 | 5.86 |
| 44376.041666666664 | 5.75 |
| 44376.052083333336 | 5.74 |
| 44376.0625 | 5.66 |
| 44376.072916666664 | 5.64 |
| 44376.083333333336 | 5.61 |
| 44376.09375 | 5.68 |
| 44376.104166666664 | 5.66 |
| 44376.114583333336 | 5.61 |
| 44376.125 | 5.67 |
| 44376.135416666664 | 5.56 |
| 44376.145833333336 | 5.62 |
| 44376.15625 | 5.58 |
| 44376.166666666664 | 5.43 |
| 44376.177083333336 | 5.38 |
| 44376.1875 | 5.38 |
| 44376.197916666664 | 5.32 |
| 44376.208333333336 | 5.33 |
| 44376.21875 | 5.38 |
| 44376.229166666664 | 5 |
| 44376.239583333336 | 5.11 |
| 44376.25 | 5.44 |
| 44376.260416666664 | 5.17 |
| 44376.270833333336 | 4.81 |
| 44376.28125 | 4.51 |
| 44376.291666666664 | 4.17 |
| 44376.302083333336 | 4.41 |
| 44376.3125 | 3.95 |
| 44376.322916666664 | 4.38 |
| 44376.333333333336 | 4.54 |
| 44376.34375 | 4.24 |
| 44376.354166666664 | 4.45 |
| 44376.364583333336 | 4.25 |
| 44376.375 | 4.23 |
| 44376.385416666664 | 4.16 |
| 44376.395833333336 | 4.15 |
| 44376.40625 | 4.07 |
| 44376.416666666664 | 3.76 |
| 44376.427083333336 | 3.86 |
| 44376.4375 | 3.66 |
| 44376.447916666664 | 3.42 |
| 44376.458333333336 | 3.44 |
| 44376.46875 | 2.57 |
| 44376.479166666664 | 3.44 |
| 44376.489583333336 | 3.32 |
| 44376.5 | 3.6 |
| 44376.510416666664 | 3.59 |
| 44376.520833333336 | 3.58 |
| 44376.53125 | 3.58 |
| 44376.541666666664 | 3.71 |
| 44376.552083333336 | 3.9 |
| 44376.5625 | 3.87 |
| 44376.572916666664 | 3.9 |
| 44376.583333333336 | 3.92 |
| 44376.59375 | 4.1 |
| 44376.604166666664 | 4.22 |
| 44376.614583333336 | 4.31 |
| 44376.625 | 4.56 |
| 44376.635416666664 | 4.76 |
| 44376.645833333336 | 5 |
| 44376.65625 | 5.08 |
| 44376.666666666664 | 5.24 |
| 44376.677083333336 | 5.17 |
| 44376.6875 | 5.17 |
| 44376.697916666664 | 5.43 |
| 44376.708333333336 | 5.28 |
| 44376.71875 | 5.39 |
| 44376.729166666664 | 5.43 |
| 44376.739583333336 | 5.5 |
| 44376.75 | 5.67 |
| 44376.760416666664 | 6.42 |
| 44376.770833333336 | 5.94 |
| 44376.78125 | 6.49 |
| 44376.791666666664 | 6.24 |
| 44376.802083333336 | 6.48 |
| 44376.8125 | 6.34 |
| 44376.822916666664 | 6.34 |
| 44376.833333333336 | 6.45 |
| 44376.84375 | 6.65 |
| 44376.854166666664 | 7.01 |
| 44376.864583333336 | 7.06 |
| 44376.875 | 7.17 |
| 44376.885416666664 | 7.22 |
| 44376.895833333336 | 7.13 |
| 44376.90625 | 7.13 |
| 44376.916666666664 | 7.11 |
| 44376.927083333336 | 7.17 |
| 44376.9375 | 7.06 |
| 44376.947916666664 | 7.01 |
| 44376.958333333336 | 7.01 |
| 44376.96875 | 6.94 |
| 44376.979166666664 | 6.83 |
| 44376.989583333336 | 6.54 |
| 44377.0 | 6.28 |
| 44377.010416666664 | 5.74 |
| 44377.020833333336 | 5.95 |
| 44377.03125 | 5.97 |
| 44377.041666666664 | 5.82 |
| 44377.052083333336 | 5.62 |
| 44377.0625 | 5.61 |
| 44377.072916666664 | 5.3 |
| 44377.083333333336 | 5.59 |
| 44377.09375 | 5.45 |
| 44377.104166666664 | 5.15 |
| 44377.114583333336 | 5.12 |
| 44377.125 | 5.18 |
| 44377.135416666664 | 5.37 |
| 44377.145833333336 | 5.15 |
| 44377.15625 | 5.31 |
| 44377.166666666664 | 5.17 |
| 44377.177083333336 | 5.13 |
| 44377.1875 | 5.17 |
| 44377.197916666664 | 4.48 |
| 44377.208333333336 | 4.96 |
| 44377.21875 | 3.88 |
| 44377.229166666664 | 3.57 |
| 44377.239583333336 | 3.53 |
| 44377.25 | 4.2 |
| 44377.260416666664 | 4.1 |
| 44377.270833333336 | 4.64 |
| 44377.28125 | 4.86 |
| 44377.291666666664 | 4.97 |
| 44377.302083333336 | 4.58 |
| 44377.3125 | 4.74 |
| 44377.322916666664 | 3.98 |
| 44377.333333333336 | 3.66 |
| 44377.34375 | 3.91 |
| 44377.354166666664 | 3.66 |
| 44377.364583333336 | 4.08 |
| 44377.375 | 3.87 |
| 44377.385416666664 | 3.82 |
| 44377.395833333336 | 3.79 |
| 44377.40625 | 3.6 |
| 44377.416666666664 | 3.57 |
| 44377.427083333336 | 3.57 |
| 44377.4375 | 3.59 |
| 44377.447916666664 | 3.42 |
| 44377.458333333336 | 3.34 |
| 44377.46875 | 3.34 |
| 44377.479166666664 | 3.22 |
| 44377.489583333336 | 2.49 |
| 44377.5 | 1.98 |
| 44377.510416666664 | 2.46 |
| 44377.520833333336 | 2.7 |
| 44377.53125 | 3.06 |
| 44377.541666666664 | 2.8 |
| 44377.552083333336 | 2.95 |
| 44377.5625 | 3.32 |
| 44377.572916666664 | 3.57 |
| 44377.583333333336 | 4 |
| 44377.59375 | 3.83 |
| 44377.604166666664 | 4.08 |
| 44377.614583333336 | 4.23 |
| 44377.625 | 4 |
| 44377.635416666664 | 4.02 |
| 44377.645833333336 | 4.86 |
| 44377.65625 | 4.84 |
| 44377.666666666664 | 5.25 |
| 44377.677083333336 | 4.87 |
| 44377.6875 | 5.15 |
| 44377.697916666664 | 5.07 |
| 44377.708333333336 | 4.72 |
| 44377.71875 | 4.89 |
| 44377.729166666664 | 5.07 |
| 44377.739583333336 | 5.31 |
| 44377.75 | 4.97 |
| 44377.760416666664 | 4.73 |
| 44377.770833333336 | 3.91 |
| 44377.78125 | 4.9 |
| 44377.791666666664 | 6.62 |
| 44377.802083333336 | 6.6 |
| 44377.8125 | 6.15 |
| 44377.822916666664 | 6.61 |
| 44377.833333333336 | 7.13 |
| 44377.84375 | 7.83 |
| 44377.854166666664 | 7.48 |
| 44377.864583333336 | 7.27 |
| 44377.875 | 7.07 |
| 44377.885416666664 | 6.88 |
| 44377.895833333336 | 6.95 |
| 44377.90625 | 7.25 |
| 44377.916666666664 | 7.42 |
| 44377.927083333336 | 7.53 |
| 44377.9375 | 7.49 |
| 44377.947916666664 | 7.47 |
| 44377.958333333336 | 7.57 |
| 44377.96875 | 7.6 |
| 44377.979166666664 | 7.37 |
| 44377.989583333336 | 7.31 |
| 44378.0 | 7.02 |
| 44378.010416666664 | 6.91 |
| 44378.020833333336 | 6.84 |
| 44378.03125 | 6.3 |
| 44378.041666666664 | 6.2 |
| 44378.052083333336 | 6 |
| 44378.0625 | 5.66 |
| 44378.072916666664 | 5.36 |
| 44378.083333333336 | 5.4 |
| 44378.09375 | 5.31 |
| 44378.104166666664 | 5.2 |
| 44378.114583333336 | 5.1 |
| 44378.125 | 5.03 |
| 44378.135416666664 | 4.81 |
| 44378.145833333336 | 4.78 |
| 44378.15625 | 4.74 |